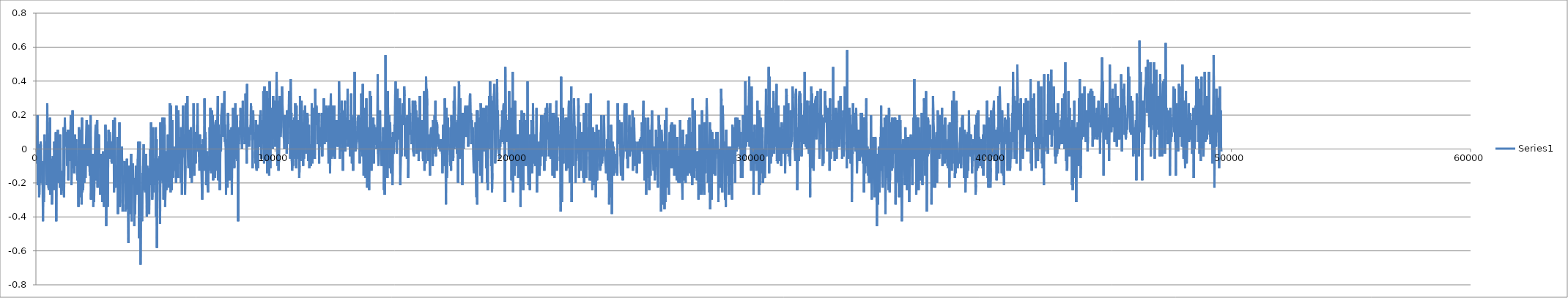
| Category | Series 0 |
|---|---|
| 3.4161954 | -0.043 |
| 18.8090758 | -0.085 |
| 35.1190087 | 0.057 |
| 51.4309406 | 0.085 |
| 67.7428724 | 0.199 |
| 84.056805 | -0.213 |
| 100.3647372 | 0.028 |
| 116.6826694 | 0 |
| 132.9906016 | -0.284 |
| 149.294533 | -0.255 |
| 165.6114663 | -0.17 |
| 181.9213986 | -0.199 |
| 198.23433 | 0.043 |
| 214.5512621 | 0.014 |
| 230.8641946 | -0.128 |
| 247.1801267 | -0.085 |
| 263.4940593 | -0.085 |
| 279.8109925 | -0.213 |
| 296.1239239 | -0.426 |
| 312.4368564 | -0.071 |
| 328.7477871 | -0.312 |
| 345.0657193 | -0.213 |
| 361.3796508 | 0.085 |
| 377.6905815 | -0.085 |
| 394.0005127 | 0.043 |
| 410.3154453 | 0.043 |
| 426.6213779 | -0.028 |
| 442.9363105 | -0.142 |
| 459.2472423 | -0.213 |
| 475.5641739 | 0.27 |
| 491.8741068 | -0.128 |
| 508.1930402 | -0.014 |
| 524.5009718 | -0.227 |
| 540.8219042 | -0.241 |
| 557.132836 | 0.085 |
| 573.4477675 | 0.057 |
| 589.7636996 | 0.185 |
| 606.0816324 | -0.27 |
| 622.4275657 | -0.114 |
| 638.7504976 | -0.057 |
| 655.0704294 | -0.128 |
| 671.3803611 | -0.326 |
| 687.699294 | -0.255 |
| 704.0102247 | -0.043 |
| 720.3291581 | -0.057 |
| 736.6890927 | -0.17 |
| 752.9970243 | -0.241 |
| 769.3179578 | 0.043 |
| 785.6338894 | -0.071 |
| 801.9618233 | -0.028 |
| 818.2787566 | -0.142 |
| 834.5986894 | 0.099 |
| 850.9136215 | -0.426 |
| 867.2485541 | -0.057 |
| 883.5714872 | -0.185 |
| 899.8944202 | -0.156 |
| 916.2403546 | 0.114 |
| 932.5612859 | -0.17 |
| 948.8822172 | -0.199 |
| 965.1951496 | -0.071 |
| 981.5370816 | -0.057 |
| 997.8830154 | -0.227 |
| 1014.2169491 | 0.085 |
| 1030.5278809 | -0.099 |
| 1046.8488138 | -0.213 |
| 1063.1707463 | -0.27 |
| 1079.4866773 | -0.27 |
| 1095.8236117 | -0.213 |
| 1112.1365436 | -0.142 |
| 1128.4564765 | -0.128 |
| 1144.7684084 | -0.241 |
| 1161.084341 | 0.128 |
| 1177.4032739 | -0.284 |
| 1193.7322078 | 0 |
| 1210.0381405 | 0.185 |
| 1226.3630742 | 0.028 |
| 1242.6930077 | 0.014 |
| 1259.0169408 | 0.014 |
| 1275.3368726 | 0.099 |
| 1291.6528058 | 0.028 |
| 1308.0137404 | -0.099 |
| 1324.3206732 | -0.014 |
| 1340.6366053 | 0.114 |
| 1356.9555386 | -0.185 |
| 1373.2604701 | 0.114 |
| 1389.5924037 | 0.057 |
| 1405.9113371 | 0.057 |
| 1422.2312683 | 0.014 |
| 1438.5712018 | -0.071 |
| 1454.8981345 | 0.199 |
| 1471.2190658 | 0 |
| 1487.5369991 | -0.213 |
| 1503.8559303 | -0.043 |
| 1520.1828619 | -0.085 |
| 1536.490793 | 0.227 |
| 1552.8187246 | -0.099 |
| 1569.1446579 | -0.114 |
| 1585.4635896 | -0.043 |
| 1601.7815224 | -0.142 |
| 1618.096455 | 0 |
| 1634.4373896 | 0.085 |
| 1650.756323 | -0.085 |
| 1667.0692538 | -0.071 |
| 1683.3941864 | 0.057 |
| 1699.7141188 | -0.099 |
| 1716.0360512 | -0.071 |
| 1732.3529839 | -0.185 |
| 1748.6799172 | -0.099 |
| 1764.9818485 | -0.071 |
| 1781.2997802 | -0.341 |
| 1797.609713 | 0.128 |
| 1813.9196448 | 0.028 |
| 1830.2515784 | -0.284 |
| 1846.5755104 | -0.028 |
| 1862.9134437 | -0.128 |
| 1879.2323766 | 0.114 |
| 1895.5493087 | -0.142 |
| 1911.8792422 | -0.326 |
| 1928.2571778 | 0.185 |
| 1944.5881114 | -0.255 |
| 1960.9090438 | -0.028 |
| 1977.2239769 | -0.241 |
| 1993.5379089 | 0.028 |
| 2009.8608414 | -0.142 |
| 2026.1697731 | -0.199 |
| 2042.5087071 | 0.028 |
| 2058.8456398 | -0.028 |
| 2075.1635726 | -0.17 |
| 2091.4925066 | 0 |
| 2107.8634418 | 0.114 |
| 2124.188375 | 0.17 |
| 2140.5143054 | -0.085 |
| 2156.8322376 | -0.099 |
| 2173.1811722 | 0.142 |
| 2189.5251064 | 0.099 |
| 2205.8550388 | -0.057 |
| 2222.2039733 | -0.014 |
| 2238.5269053 | -0.099 |
| 2254.8428385 | -0.156 |
| 2271.1697724 | -0.128 |
| 2287.4937049 | 0.199 |
| 2303.836638 | -0.298 |
| 2320.1565692 | -0.199 |
| 2336.482503 | -0.156 |
| 2352.8044349 | -0.099 |
| 2369.1173668 | -0.028 |
| 2385.4553013 | -0.17 |
| 2401.7912351 | -0.341 |
| 2418.1241676 | -0.17 |
| 2434.4401008 | -0.312 |
| 2450.7530333 | -0.099 |
| 2467.0659664 | -0.043 |
| 2483.4389029 | 0.099 |
| 2499.7668345 | 0.142 |
| 2516.1037678 | -0.185 |
| 2532.4146991 | 0.099 |
| 2548.7336319 | 0.156 |
| 2565.081567 | 0.17 |
| 2581.4124999 | -0.227 |
| 2597.728432 | 0.085 |
| 2614.0523657 | -0.085 |
| 2630.3922981 | 0.085 |
| 2646.7162312 | -0.014 |
| 2663.0501643 | -0.114 |
| 2679.4200989 | -0.028 |
| 2695.7400318 | -0.27 |
| 2712.0859668 | -0.028 |
| 2728.4679021 | -0.213 |
| 2744.7978344 | -0.199 |
| 2761.1167667 | -0.043 |
| 2777.4296992 | -0.312 |
| 2793.7416305 | -0.156 |
| 2810.071564 | -0.014 |
| 2826.3814963 | -0.085 |
| 2842.7474324 | -0.341 |
| 2859.0573641 | -0.142 |
| 2875.3632962 | -0.043 |
| 2891.6772282 | -0.27 |
| 2907.9931597 | 0.142 |
| 2924.3090924 | 0.057 |
| 2940.6290253 | -0.454 |
| 2956.9639579 | 0.043 |
| 2973.2828902 | -0.085 |
| 2989.6208241 | -0.17 |
| 3005.9327554 | -0.341 |
| 3022.2576892 | -0.057 |
| 3038.577622 | 0.114 |
| 3054.9195556 | -0.057 |
| 3071.2464884 | 0.014 |
| 3087.6044223 | 0.099 |
| 3103.9353564 | 0.028 |
| 3120.2532897 | -0.057 |
| 3136.580223 | -0.028 |
| 3152.8991542 | 0.028 |
| 3169.2300882 | -0.085 |
| 3185.5600206 | 0.043 |
| 3201.8769528 | -0.071 |
| 3218.2018848 | -0.014 |
| 3234.5228183 | 0.17 |
| 3250.828751 | 0.142 |
| 3267.1486838 | -0.255 |
| 3283.4706163 | -0.057 |
| 3299.7985502 | 0.185 |
| 3316.1064824 | -0.227 |
| 3332.4154141 | -0.099 |
| 3348.7333469 | -0.128 |
| 3365.074281 | -0.099 |
| 3381.4002142 | -0.156 |
| 3397.6961452 | -0.17 |
| 3414.0000766 | 0.071 |
| 3430.3130091 | -0.383 |
| 3446.6329419 | -0.043 |
| 3462.9648761 | -0.043 |
| 3479.2738083 | -0.156 |
| 3495.5777403 | 0.156 |
| 3511.893673 | -0.341 |
| 3528.2386056 | -0.298 |
| 3544.5575385 | -0.085 |
| 3560.8724677 | 0 |
| 3577.1884004 | -0.099 |
| 3593.4993311 | 0.014 |
| 3609.8082633 | -0.099 |
| 3626.1191963 | -0.369 |
| 3642.4291286 | -0.199 |
| 3658.7500598 | -0.156 |
| 3675.0669926 | -0.17 |
| 3691.3779249 | -0.199 |
| 3707.6888579 | -0.071 |
| 3724.0077896 | -0.114 |
| 3740.3307215 | -0.369 |
| 3756.6396543 | -0.298 |
| 3772.9465865 | -0.355 |
| 3789.2565188 | -0.27 |
| 3805.5794524 | -0.057 |
| 3821.8953851 | -0.341 |
| 3838.2113172 | -0.341 |
| 3854.5312501 | -0.255 |
| 3870.8401823 | -0.554 |
| 3887.191117 | -0.099 |
| 3903.5170497 | -0.114 |
| 3919.8459831 | -0.383 |
| 3936.165916 | -0.156 |
| 3952.4738482 | -0.298 |
| 3968.8197831 | -0.085 |
| 3985.1427167 | -0.028 |
| 4001.4616501 | -0.426 |
| 4017.8115853 | -0.156 |
| 4034.1435194 | -0.156 |
| 4050.4624528 | -0.085 |
| 4066.8073871 | -0.185 |
| 4083.1213197 | -0.17 |
| 4099.4942545 | -0.213 |
| 4115.8001866 | -0.454 |
| 4132.1141191 | -0.312 |
| 4148.4350526 | -0.383 |
| 4164.7499852 | -0.185 |
| 4181.0779191 | -0.099 |
| 4197.3908494 | -0.255 |
| 4213.6967809 | -0.142 |
| 4230.0087139 | -0.227 |
| 4246.3356472 | -0.27 |
| 4262.6705809 | -0.057 |
| 4278.995513 | 0.043 |
| 4295.3024435 | -0.028 |
| 4311.6213757 | -0.525 |
| 4327.9333082 | -0.298 |
| 4344.2622416 | 0.043 |
| 4360.5961747 | -0.369 |
| 4376.9091072 | -0.681 |
| 4393.2090373 | -0.355 |
| 4409.5139698 | -0.397 |
| 4425.8359023 | -0.397 |
| 4442.1588348 | -0.426 |
| 4458.4687665 | -0.142 |
| 4474.7746986 | -0.185 |
| 4491.1066322 | -0.057 |
| 4507.442566 | 0.028 |
| 4523.7664975 | -0.241 |
| 4540.0904306 | -0.199 |
| 4556.3953632 | -0.213 |
| 4572.7212958 | -0.255 |
| 4589.0302287 | -0.099 |
| 4605.3431611 | -0.028 |
| 4621.6610945 | -0.255 |
| 4637.9900279 | -0.397 |
| 4654.3009586 | -0.099 |
| 4670.6148911 | -0.27 |
| 4686.9358241 | -0.185 |
| 4703.2687571 | -0.114 |
| 4719.5836903 | -0.227 |
| 4735.9286235 | -0.383 |
| 4752.261556 | -0.156 |
| 4768.5814895 | -0.213 |
| 4784.9104229 | 0 |
| 4801.2343566 | -0.099 |
| 4817.5462895 | 0.156 |
| 4833.8842223 | 0.014 |
| 4850.2111556 | -0.142 |
| 4866.5490896 | -0.298 |
| 4882.9170257 | -0.185 |
| 4899.2519595 | 0.128 |
| 4915.5668915 | -0.255 |
| 4931.8778245 | -0.057 |
| 4948.1817559 | -0.213 |
| 4964.5126894 | -0.213 |
| 4980.8576243 | -0.142 |
| 4997.1785578 | -0.114 |
| 5013.4964906 | 0.128 |
| 5029.8274224 | -0.397 |
| 5046.1553546 | 0.057 |
| 5062.4662876 | -0.582 |
| 5078.7952193 | -0.142 |
| 5095.1131515 | -0.114 |
| 5111.4230838 | -0.128 |
| 5127.7370164 | -0.057 |
| 5144.0609495 | -0.085 |
| 5160.3858827 | -0.185 |
| 5176.7258173 | -0.043 |
| 5193.0377491 | -0.44 |
| 5209.3576815 | 0.156 |
| 5225.6736136 | -0.142 |
| 5241.9845454 | -0.043 |
| 5258.2974773 | -0.185 |
| 5274.6034077 | -0.185 |
| 5290.9203399 | 0.185 |
| 5307.2422729 | -0.199 |
| 5323.6152071 | 0 |
| 5339.9321398 | -0.298 |
| 5356.2380725 | 0.028 |
| 5372.5600049 | 0.185 |
| 5388.8699373 | 0.114 |
| 5405.1818697 | -0.341 |
| 5421.4948016 | -0.199 |
| 5437.8107332 | -0.028 |
| 5454.1176659 | -0.241 |
| 5470.4445992 | -0.014 |
| 5486.7655315 | -0.199 |
| 5503.1034655 | -0.099 |
| 5519.4724012 | 0.085 |
| 5535.8083344 | -0.142 |
| 5552.1262666 | -0.227 |
| 5568.4461984 | 0.043 |
| 5584.7771319 | -0.199 |
| 5601.0970648 | 0.27 |
| 5617.4159965 | 0 |
| 5633.7619309 | -0.255 |
| 5650.078863 | 0.255 |
| 5666.4027962 | 0.028 |
| 5682.746731 | -0.241 |
| 5699.0726637 | 0.17 |
| 5715.3835955 | -0.014 |
| 5731.7055268 | -0.17 |
| 5748.0204594 | -0.142 |
| 5764.3303917 | -0.099 |
| 5780.6543248 | -0.128 |
| 5796.9832582 | 0.014 |
| 5813.291191 | -0.014 |
| 5829.6111244 | -0.085 |
| 5845.932058 | -0.099 |
| 5862.2359894 | -0.199 |
| 5878.5469217 | 0.255 |
| 5894.8618538 | -0.043 |
| 5911.1667853 | 0 |
| 5927.4867181 | -0.014 |
| 5943.8216525 | -0.17 |
| 5960.1435855 | 0.227 |
| 5976.4535172 | 0 |
| 5992.7684498 | -0.085 |
| 6009.0773826 | 0.071 |
| 6025.3933153 | 0.071 |
| 6041.7062483 | -0.085 |
| 6058.0561824 | -0.199 |
| 6074.391115 | 0.128 |
| 6090.7300484 | -0.085 |
| 6107.03698 | -0.27 |
| 6123.3579124 | 0.043 |
| 6139.7018461 | 0.114 |
| 6156.0117773 | 0.255 |
| 6172.3197101 | 0.028 |
| 6188.629643 | 0.085 |
| 6204.9435761 | -0.043 |
| 6221.254509 | -0.057 |
| 6237.5714423 | -0.27 |
| 6253.889375 | -0.099 |
| 6270.2023075 | 0.27 |
| 6286.5632428 | 0.028 |
| 6302.8681748 | 0 |
| 6319.1841074 | 0.014 |
| 6335.4900395 | 0.312 |
| 6351.812972 | -0.014 |
| 6368.1299053 | -0.099 |
| 6384.446838 | -0.114 |
| 6400.7747708 | 0.014 |
| 6417.0937037 | 0.114 |
| 6433.4026359 | -0.014 |
| 6449.7365696 | -0.114 |
| 6466.0625028 | -0.17 |
| 6482.3834352 | 0.128 |
| 6498.6953671 | 0.028 |
| 6515.0103003 | -0.199 |
| 6531.3212326 | -0.128 |
| 6547.6461664 | -0.128 |
| 6563.9851003 | -0.085 |
| 6580.3040332 | -0.114 |
| 6596.6129632 | 0.27 |
| 6612.9118938 | -0.128 |
| 6629.2248257 | -0.156 |
| 6645.5227573 | 0.057 |
| 6661.8686917 | 0.099 |
| 6678.1816231 | -0.085 |
| 6694.4895547 | 0.099 |
| 6710.8094876 | 0.043 |
| 6727.1124184 | 0.028 |
| 6743.4363515 | 0.142 |
| 6759.7772851 | 0.27 |
| 6776.0822171 | -0.014 |
| 6792.3951501 | 0.014 |
| 6808.7150825 | 0 |
| 6825.0340159 | -0.057 |
| 6841.3459477 | -0.128 |
| 6857.6608803 | 0.085 |
| 6873.9928139 | -0.085 |
| 6890.3117462 | -0.043 |
| 6906.6246787 | 0.028 |
| 6922.9316114 | -0.128 |
| 6939.2485435 | -0.227 |
| 6955.5844751 | -0.298 |
| 6971.8894066 | -0.17 |
| 6988.2023396 | 0.057 |
| 7004.532272 | -0.071 |
| 7020.8552056 | -0.014 |
| 7037.1781386 | -0.128 |
| 7053.5190716 | 0.298 |
| 7069.8260043 | 0.028 |
| 7086.1649377 | 0.099 |
| 7102.4898704 | 0.057 |
| 7118.812804 | -0.213 |
| 7135.1467377 | -0.071 |
| 7151.4606697 | -0.128 |
| 7167.7866034 | -0.014 |
| 7184.1025367 | -0.227 |
| 7200.4204694 | -0.255 |
| 7216.7334019 | -0.043 |
| 7233.0603347 | -0.128 |
| 7249.3742666 | -0.085 |
| 7265.7011999 | 0.128 |
| 7282.0291333 | -0.028 |
| 7298.3480656 | 0.241 |
| 7314.659998 | 0.043 |
| 7331.0059312 | -0.142 |
| 7347.3358647 | 0.099 |
| 7363.6497978 | 0.227 |
| 7379.9647304 | -0.057 |
| 7396.2856622 | 0.199 |
| 7412.5955934 | -0.185 |
| 7428.9425279 | 0.142 |
| 7445.2614607 | 0.128 |
| 7461.5683912 | -0.057 |
| 7477.8753233 | -0.142 |
| 7494.1862551 | -0.17 |
| 7510.4911861 | 0.156 |
| 7526.8001183 | 0.17 |
| 7543.1290523 | 0.156 |
| 7559.4439838 | -0.128 |
| 7575.797918 | 0.099 |
| 7592.128851 | 0.099 |
| 7608.4447842 | 0.312 |
| 7624.7697168 | -0.185 |
| 7641.0836494 | 0.142 |
| 7657.3895815 | -0.028 |
| 7673.720515 | 0.014 |
| 7690.035447 | -0.241 |
| 7706.3513797 | -0.085 |
| 7722.6623121 | 0.085 |
| 7739.0132473 | -0.014 |
| 7755.3311801 | 0.199 |
| 7771.6501129 | 0.199 |
| 7787.9590446 | 0.27 |
| 7804.2779769 | 0.241 |
| 7820.5869097 | 0.128 |
| 7836.9518446 | 0.071 |
| 7853.2637776 | 0.213 |
| 7869.5727098 | 0.185 |
| 7885.9186437 | 0.341 |
| 7902.2265753 | 0.043 |
| 7918.551509 | 0.142 |
| 7934.8644415 | 0.014 |
| 7951.2063746 | -0.27 |
| 7967.5203071 | -0.057 |
| 7983.9042442 | 0.057 |
| 8000.2061749 | -0.142 |
| 8016.5621093 | -0.227 |
| 8032.8770414 | 0.213 |
| 8049.1859742 | 0.142 |
| 8065.4979072 | -0.185 |
| 8081.8278401 | 0 |
| 8098.1327716 | 0.114 |
| 8114.4417038 | 0.099 |
| 8130.7936369 | 0.057 |
| 8147.1175689 | -0.185 |
| 8163.4205002 | -0.156 |
| 8179.7474324 | 0.128 |
| 8196.0833668 | -0.27 |
| 8212.4023002 | 0.128 |
| 8228.7062321 | -0.085 |
| 8245.034166 | 0.241 |
| 8261.3690998 | 0.128 |
| 8277.7020334 | 0.014 |
| 8294.0219657 | -0.114 |
| 8310.349898 | -0.099 |
| 8326.6878325 | 0.128 |
| 8343.0027651 | 0.27 |
| 8359.3106978 | -0.028 |
| 8375.6276305 | -0.057 |
| 8391.9605642 | 0.199 |
| 8408.2754968 | 0.156 |
| 8424.593429 | -0.071 |
| 8440.9163626 | 0.071 |
| 8457.2322953 | -0.426 |
| 8473.5652289 | 0.043 |
| 8489.8751612 | 0.028 |
| 8506.2020951 | 0.128 |
| 8522.5330291 | 0.085 |
| 8538.8479617 | 0.114 |
| 8555.1728949 | 0.241 |
| 8571.4998276 | 0.185 |
| 8587.8037596 | 0.114 |
| 8604.1206923 | 0.028 |
| 8620.4586263 | 0 |
| 8636.7705587 | 0.128 |
| 8653.089491 | 0.284 |
| 8669.4054236 | 0.071 |
| 8685.736356 | 0.114 |
| 8702.0382884 | 0.085 |
| 8718.3462206 | 0.114 |
| 8734.6601532 | 0.028 |
| 8750.9850864 | 0.128 |
| 8767.2910184 | 0.326 |
| 8783.6169506 | 0.057 |
| 8799.9398825 | 0.085 |
| 8816.2558152 | -0.085 |
| 8832.5687477 | 0.383 |
| 8848.8816796 | 0.014 |
| 8865.2156133 | 0.085 |
| 8881.5295464 | 0.128 |
| 8897.8564791 | 0.114 |
| 8914.1724123 | 0.057 |
| 8930.4843448 | 0.014 |
| 8946.8082773 | 0.114 |
| 8963.1292103 | 0.085 |
| 8979.4561413 | 0.142 |
| 8995.7740747 | 0.27 |
| 9012.1050082 | 0.142 |
| 9028.4249399 | 0.142 |
| 9044.7448728 | 0.185 |
| 9061.0658047 | -0.114 |
| 9070.732782 | -0.014 |
| 9087.0237137 | 0.227 |
| 9103.3386463 | 0.099 |
| 9119.6505793 | 0.057 |
| 9136.0065126 | 0.099 |
| 9152.335446 | 0.085 |
| 9168.6373784 | 0.043 |
| 9184.9383102 | -0.085 |
| 9201.2752435 | 0.17 |
| 9217.6201779 | -0.114 |
| 9233.9441115 | -0.128 |
| 9250.2540438 | 0.014 |
| 9266.5729772 | 0.142 |
| 9282.8899094 | -0.114 |
| 9299.2078427 | 0 |
| 9315.5237754 | 0.057 |
| 9331.8407081 | 0.114 |
| 9348.1476402 | 0.014 |
| 9364.472574 | 0.199 |
| 9380.7925069 | 0.014 |
| 9397.1114386 | 0.227 |
| 9413.4363712 | 0.085 |
| 9429.7713055 | -0.057 |
| 9446.0892377 | 0.17 |
| 9462.4191712 | 0.043 |
| 9478.7331037 | 0.028 |
| 9495.0610371 | 0.043 |
| 9511.3819706 | 0.341 |
| 9527.695902 | 0 |
| 9544.0128342 | -0.085 |
| 9560.338768 | 0.369 |
| 9576.6467002 | 0.028 |
| 9592.9636318 | 0.028 |
| 9609.296566 | 0.156 |
| 9625.6285001 | 0.199 |
| 9641.9434332 | -0.071 |
| 9658.2423633 | 0.341 |
| 9674.5622967 | -0.142 |
| 9690.8952309 | 0.028 |
| 9707.2161644 | 0.114 |
| 9723.5360956 | 0.298 |
| 9739.8490281 | 0.255 |
| 9756.16196 | -0.156 |
| 9772.4898939 | 0.397 |
| 9788.8088257 | 0.355 |
| 9805.1417587 | -0.114 |
| 9821.4846929 | 0.241 |
| 9837.8456271 | 0.227 |
| 9854.1495579 | 0.227 |
| 9870.4664901 | 0.099 |
| 9886.7874219 | 0.057 |
| 9903.1133557 | 0 |
| 9919.4272888 | 0.312 |
| 9935.7382217 | 0.227 |
| 9952.0621537 | 0.199 |
| 9968.3970869 | 0.057 |
| 9984.746022 | 0.284 |
| 10001.0609546 | 0.014 |
| 10017.3778868 | 0.085 |
| 10033.7098198 | 0.114 |
| 10050.0297527 | 0.099 |
| 10066.3556859 | 0.454 |
| 10082.6666189 | 0.213 |
| 10098.9705497 | -0.099 |
| 10115.2864818 | 0.185 |
| 10131.593414 | 0.284 |
| 10147.9053458 | -0.128 |
| 10164.24728 | -0.071 |
| 10180.5792136 | 0.028 |
| 10196.9131472 | 0.312 |
| 10213.2330807 | 0.227 |
| 10229.5490133 | 0.071 |
| 10245.8719464 | 0.071 |
| 10262.1858784 | 0.142 |
| 10278.4958102 | 0.227 |
| 10294.8067409 | 0.369 |
| 10311.121674 | 0.27 |
| 10327.4536081 | 0.213 |
| 10343.7745411 | 0.17 |
| 10360.0924744 | 0.071 |
| 10376.4084076 | 0.057 |
| 10392.7243397 | 0 |
| 10409.0382729 | 0.199 |
| 10425.3512059 | 0.043 |
| 10441.7091404 | 0.085 |
| 10458.0420718 | 0.114 |
| 10474.3480044 | 0.085 |
| 10490.6609364 | -0.028 |
| 10506.9768696 | 0.227 |
| 10523.2938012 | 0.028 |
| 10539.6087332 | 0.099 |
| 10555.9296667 | 0.17 |
| 10572.2686013 | 0.128 |
| 10588.5925344 | 0.341 |
| 10604.9014661 | 0.255 |
| 10621.2193994 | 0.199 |
| 10637.525331 | -0.057 |
| 10653.8392624 | 0.412 |
| 10670.1581958 | 0.17 |
| 10686.4771286 | 0.213 |
| 10702.824063 | -0.071 |
| 10719.1389962 | -0.128 |
| 10735.4829305 | -0.028 |
| 10751.8078642 | -0.099 |
| 10768.1117945 | 0.17 |
| 10784.4207262 | 0.099 |
| 10800.7356588 | 0.185 |
| 10817.0635922 | 0 |
| 10833.3935256 | -0.057 |
| 10849.7204589 | 0.27 |
| 10866.0633925 | 0.057 |
| 10882.3813253 | -0.114 |
| 10898.7152585 | 0.255 |
| 10915.0261903 | -0.057 |
| 10931.3641242 | -0.057 |
| 10947.6800563 | 0.085 |
| 10963.9919887 | 0.17 |
| 10980.3129217 | -0.014 |
| 10996.6118539 | 0.071 |
| 11012.9317874 | -0.17 |
| 11029.2607191 | -0.099 |
| 11045.5786507 | 0.312 |
| 11061.9095843 | -0.071 |
| 11078.2605178 | 0 |
| 11094.5824508 | 0.014 |
| 11110.9313859 | 0.284 |
| 11127.2223172 | 0.142 |
| 11143.5452491 | 0.028 |
| 11159.8621824 | 0.142 |
| 11176.1791156 | -0.099 |
| 11192.507049 | 0.156 |
| 11208.8259807 | -0.057 |
| 11225.1809162 | 0.227 |
| 11241.4918469 | 0.085 |
| 11257.8257811 | 0.255 |
| 11274.1447139 | 0.156 |
| 11290.4646468 | 0.014 |
| 11306.7905801 | -0.028 |
| 11323.1275145 | 0.114 |
| 11339.4594486 | 0.199 |
| 11355.7783809 | 0.213 |
| 11372.0993127 | 0.156 |
| 11388.4142448 | -0.071 |
| 11404.7281779 | 0 |
| 11421.0761118 | 0.142 |
| 11437.3940446 | -0.114 |
| 11453.7189783 | 0.028 |
| 11470.034911 | -0.043 |
| 11486.357844 | 0.014 |
| 11502.6697759 | -0.099 |
| 11518.9847074 | 0.014 |
| 11535.3236419 | 0.27 |
| 11551.6605763 | 0.185 |
| 11567.9785091 | -0.085 |
| 11584.2944412 | 0.043 |
| 11600.6093733 | 0.142 |
| 11616.9413068 | 0.241 |
| 11633.2592402 | -0.057 |
| 11649.5661717 | -0.028 |
| 11665.8981048 | -0.057 |
| 11682.2180382 | 0.355 |
| 11698.5499707 | 0.213 |
| 11714.8799047 | 0.142 |
| 11731.2108371 | 0.255 |
| 11747.5197694 | 0.17 |
| 11763.8307017 | 0.156 |
| 11780.169634 | 0.028 |
| 11796.4965673 | 0.17 |
| 11812.8465025 | 0.142 |
| 11829.1704362 | 0.213 |
| 11845.4743687 | -0.085 |
| 11861.7973023 | 0.114 |
| 11878.1152351 | 0.128 |
| 11894.4491693 | 0.014 |
| 11910.7671021 | 0.057 |
| 11927.1130348 | 0.085 |
| 11943.4179674 | 0.071 |
| 11959.7398998 | 0.213 |
| 11976.0488327 | -0.043 |
| 11992.3617651 | 0.099 |
| 12008.6966978 | 0.199 |
| 12025.0406315 | 0.028 |
| 12041.3505644 | 0.298 |
| 12057.6644969 | 0.043 |
| 12073.9924291 | 0.028 |
| 12090.312362 | 0.227 |
| 12106.6222938 | 0.085 |
| 12122.9692271 | 0.057 |
| 12139.2921602 | 0.043 |
| 12155.6020919 | 0.255 |
| 12171.9130237 | 0.199 |
| 12188.2279563 | 0.241 |
| 12204.5418889 | 0.185 |
| 12220.8518218 | 0.043 |
| 12237.1667538 | -0.085 |
| 12253.4986879 | -0.057 |
| 12269.8206209 | 0.255 |
| 12286.1445541 | 0.071 |
| 12302.4674871 | -0.142 |
| 12318.7784195 | 0.241 |
| 12335.1053533 | 0.326 |
| 12351.4312871 | 0.028 |
| 12367.733219 | -0.057 |
| 12384.0561515 | 0.227 |
| 12400.3660832 | 0.255 |
| 12416.6980163 | 0.255 |
| 12433.0049473 | -0.043 |
| 12449.3218806 | 0.071 |
| 12465.6318134 | 0.099 |
| 12481.9447454 | 0.255 |
| 12498.2796786 | -0.057 |
| 12514.5896098 | 0.028 |
| 12530.9025411 | 0.071 |
| 12547.231474 | 0.142 |
| 12563.5694079 | 0.17 |
| 12579.8773401 | 0.17 |
| 12596.1962718 | 0.014 |
| 12612.5012033 | 0.17 |
| 12628.8571382 | 0.043 |
| 12645.2320737 | 0.014 |
| 12661.5420049 | 0.156 |
| 12677.8609372 | 0.397 |
| 12694.171869 | 0.227 |
| 12710.4918002 | -0.057 |
| 12726.8137315 | 0.17 |
| 12743.1726667 | 0.213 |
| 12759.4855992 | 0.114 |
| 12775.8065327 | 0.028 |
| 12792.119464 | 0.284 |
| 12808.4353961 | -0.014 |
| 12824.7673303 | 0.028 |
| 12841.0772631 | -0.128 |
| 12857.3901945 | 0.156 |
| 12873.7011263 | 0.156 |
| 12890.0270601 | 0.227 |
| 12906.3479925 | 0.17 |
| 12922.7049281 | 0.284 |
| 12939.070863 | -0.014 |
| 12955.3957962 | 0.185 |
| 12971.7487304 | 0.085 |
| 12988.0646631 | 0.071 |
| 13004.3805952 | 0.128 |
| 13020.6935277 | 0.057 |
| 13037.0104598 | 0.355 |
| 13053.3573937 | 0.014 |
| 13069.6693256 | 0.085 |
| 13085.9802585 | 0.128 |
| 13102.2941911 | 0.17 |
| 13118.6361252 | 0.128 |
| 13134.9570587 | -0.043 |
| 13151.2719913 | 0.114 |
| 13167.5929237 | -0.028 |
| 13183.9208565 | 0.326 |
| 13200.2977932 | 0.057 |
| 13216.6097262 | -0.085 |
| 13232.9266583 | 0.128 |
| 13249.2495908 | 0.185 |
| 13265.5655235 | -0.128 |
| 13281.8854564 | 0.057 |
| 13298.2313913 | 0.199 |
| 13314.5463239 | 0.071 |
| 13330.8752573 | 0.454 |
| 13347.18219 | 0.043 |
| 13363.5141242 | -0.014 |
| 13379.8450577 | 0.043 |
| 13396.1799903 | 0 |
| 13412.4949235 | 0.071 |
| 13428.8018562 | 0.057 |
| 13445.1197895 | 0.057 |
| 13461.4457216 | 0.185 |
| 13477.8226583 | 0.185 |
| 13494.1545925 | 0.199 |
| 13510.4615241 | 0.043 |
| 13526.7814553 | 0.028 |
| 13543.0973863 | -0.085 |
| 13559.4113188 | 0.142 |
| 13575.7412517 | 0.185 |
| 13592.0731847 | -0.014 |
| 13608.3891174 | 0.326 |
| 13624.7080508 | 0.284 |
| 13641.0139834 | 0.028 |
| 13657.3319151 | -0.043 |
| 13673.6528475 | 0.383 |
| 13689.96678 | -0.028 |
| 13706.2827116 | -0.156 |
| 13722.601645 | 0.043 |
| 13738.9305778 | 0.085 |
| 13755.2465099 | 0.241 |
| 13771.5544421 | 0.014 |
| 13787.8873746 | -0.17 |
| 13804.1933073 | 0.185 |
| 13820.5042402 | 0.298 |
| 13836.831174 | 0.156 |
| 13853.1561078 | -0.227 |
| 13869.4680408 | 0.099 |
| 13885.8129745 | 0.128 |
| 13902.135907 | -0.17 |
| 13918.4538404 | -0.085 |
| 13934.7897747 | -0.241 |
| 13951.0947062 | -0.014 |
| 13967.4186388 | 0.341 |
| 13983.736571 | -0.043 |
| 14000.0495018 | 0.128 |
| 14016.3654339 | 0.312 |
| 14032.6783658 | -0.128 |
| 14048.9902982 | 0.085 |
| 14065.3372316 | 0.142 |
| 14081.658164 | 0.014 |
| 14097.9760967 | 0.014 |
| 14114.3010299 | 0.185 |
| 14130.613963 | -0.085 |
| 14146.9318963 | 0.142 |
| 14163.274831 | 0.099 |
| 14179.580762 | 0.057 |
| 14195.9046946 | 0.128 |
| 14212.2196261 | 0.099 |
| 14228.5315574 | 0.057 |
| 14244.8474906 | 0 |
| 14261.1574235 | 0.014 |
| 14277.4723561 | 0.142 |
| 14293.8052897 | 0.44 |
| 14310.1202218 | -0.028 |
| 14326.449154 | -0.099 |
| 14342.7570868 | 0.128 |
| 14359.0700198 | 0.043 |
| 14375.3829529 | 0.099 |
| 14391.6988861 | 0.227 |
| 14408.0148188 | 0.014 |
| 14424.3577535 | -0.014 |
| 14440.6696865 | -0.085 |
| 14456.9876176 | -0.099 |
| 14473.3105507 | -0.071 |
| 14489.6284829 | 0.043 |
| 14505.944415 | -0.099 |
| 14522.2793476 | 0.128 |
| 14538.6152814 | 0.099 |
| 14554.9292134 | -0.241 |
| 14571.252147 | 0.085 |
| 14587.5710804 | -0.27 |
| 14603.886013 | 0.028 |
| 14620.2029446 | 0.554 |
| 14636.5188773 | 0.099 |
| 14652.8368095 | 0.099 |
| 14669.1507421 | 0.085 |
| 14685.4636751 | 0.099 |
| 14701.7776076 | -0.17 |
| 14718.0995407 | 0.341 |
| 14734.4094719 | 0.128 |
| 14750.7254045 | -0.014 |
| 14767.0493382 | 0.114 |
| 14783.3972727 | 0.199 |
| 14799.7222059 | -0.114 |
| 14816.057139 | 0.156 |
| 14832.378072 | -0.043 |
| 14848.7010056 | -0.142 |
| 14865.0179389 | 0.071 |
| 14881.3358717 | 0.043 |
| 14897.6698053 | -0.114 |
| 14913.9967392 | -0.213 |
| 14930.3146725 | 0.099 |
| 14946.6466067 | 0.057 |
| 14962.9645394 | -0.028 |
| 14979.2774719 | -0.014 |
| 14995.5964053 | 0.142 |
| 15011.9123385 | 0.043 |
| 15028.2302707 | 0.326 |
| 15044.5502031 | 0.397 |
| 15060.8741362 | 0.241 |
| 15077.1960692 | 0.099 |
| 15093.5130019 | -0.028 |
| 15109.8509358 | 0.128 |
| 15126.1588675 | 0.355 |
| 15142.4948013 | 0.057 |
| 15158.8137347 | 0.114 |
| 15175.1296662 | 0.227 |
| 15191.4465989 | 0.142 |
| 15207.7635311 | 0.213 |
| 15224.0804633 | 0.298 |
| 15240.3903956 | -0.213 |
| 15256.7243298 | -0.043 |
| 15273.034261 | 0.199 |
| 15289.3511926 | -0.043 |
| 15305.6771264 | 0.17 |
| 15321.9970593 | 0.185 |
| 15338.3129925 | 0.255 |
| 15354.6239254 | 0.27 |
| 15370.9408582 | 0.142 |
| 15387.2657913 | 0.156 |
| 15403.5877243 | 0.369 |
| 15419.9256583 | 0.312 |
| 15436.2555923 | -0.043 |
| 15452.5685248 | 0.014 |
| 15468.8814567 | -0.014 |
| 15485.1963899 | 0.114 |
| 15501.5083228 | 0.185 |
| 15517.817254 | -0.057 |
| 15534.1591881 | 0.199 |
| 15550.4761209 | 0.099 |
| 15566.8060549 | -0.17 |
| 15583.1389891 | -0.085 |
| 15599.4449212 | 0.128 |
| 15615.7618544 | 0.298 |
| 15632.0677865 | 0.156 |
| 15648.3787189 | 0.213 |
| 15664.7006519 | 0.085 |
| 15681.042586 | 0.114 |
| 15697.3895205 | 0.099 |
| 15713.721454 | 0.028 |
| 15730.0393868 | 0.085 |
| 15746.3773191 | 0.057 |
| 15762.705253 | 0.284 |
| 15779.0161848 | -0.014 |
| 15795.3611185 | -0.028 |
| 15811.6810514 | -0.043 |
| 15828.012985 | 0.099 |
| 15844.333918 | 0.142 |
| 15860.6558493 | 0.284 |
| 15876.9617808 | 0.241 |
| 15893.279713 | 0.185 |
| 15909.6476476 | 0.227 |
| 15925.9595794 | -0.028 |
| 15942.2905129 | 0.142 |
| 15958.6344466 | 0.071 |
| 15974.9693804 | 0.185 |
| 15991.2723123 | 0.085 |
| 16007.5932436 | -0.071 |
| 16023.9191763 | 0.071 |
| 16040.2421088 | -0.014 |
| 16056.5580409 | 0.312 |
| 16072.8619723 | 0.17 |
| 16089.1799056 | 0.128 |
| 16105.5128387 | 0.156 |
| 16121.8247711 | -0.014 |
| 16138.1417044 | 0.014 |
| 16154.468636 | 0.128 |
| 16170.7905696 | 0.17 |
| 16187.113501 | -0.057 |
| 16203.4404337 | -0.071 |
| 16219.7663669 | 0 |
| 16236.0993011 | 0.341 |
| 16252.4262344 | -0.128 |
| 16268.7441672 | 0.085 |
| 16285.0781003 | 0.071 |
| 16301.4780355 | -0.085 |
| 16317.7949677 | 0.426 |
| 16334.121901 | 0.284 |
| 16350.4328339 | 0.355 |
| 16366.7977694 | 0.255 |
| 16383.1047015 | -0.014 |
| 16399.4216348 | -0.014 |
| 16415.7535684 | -0.071 |
| 16432.068501 | 0.057 |
| 16448.3874344 | 0.085 |
| 16464.6973672 | -0.071 |
| 16481.0413021 | -0.156 |
| 16497.3792365 | 0.071 |
| 16513.684168 | 0.114 |
| 16530.0051015 | 0.128 |
| 16546.3160339 | 0.114 |
| 16562.631966 | 0.014 |
| 16578.9708988 | 0.128 |
| 16595.2838313 | -0.099 |
| 16611.5977639 | 0.17 |
| 16627.9206975 | 0.142 |
| 16644.2366302 | 0.099 |
| 16660.5615633 | -0.028 |
| 16676.8864965 | 0.199 |
| 16693.1994284 | -0.028 |
| 16709.5073612 | 0.284 |
| 16725.8202942 | -0.043 |
| 16742.1502277 | 0.17 |
| 16758.4641591 | 0.014 |
| 16774.7790917 | 0.156 |
| 16791.0930243 | 0.128 |
| 16807.4259579 | 0.028 |
| 16823.7508917 | 0.085 |
| 16840.0678249 | 0.071 |
| 16856.380758 | 0.028 |
| 16872.6986907 | 0 |
| 16889.0366247 | 0.028 |
| 16905.3395566 | 0 |
| 16921.6624896 | -0.014 |
| 16937.9814225 | 0.057 |
| 16954.2893547 | 0.028 |
| 16970.5952868 | 0.057 |
| 16986.9132179 | -0.028 |
| 17003.2251497 | -0.142 |
| 17019.5530831 | 0.043 |
| 17035.8680151 | 0.142 |
| 17052.1889486 | -0.099 |
| 17068.5058797 | 0.028 |
| 17084.8298128 | 0.014 |
| 17101.154746 | 0.298 |
| 17117.4706775 | 0.185 |
| 17133.791611 | 0.185 |
| 17150.1205433 | -0.326 |
| 17166.471478 | 0.241 |
| 17182.794411 | -0.17 |
| 17199.1253445 | -0.128 |
| 17215.4692782 | -0.071 |
| 17231.796211 | 0.185 |
| 17248.1161439 | 0.028 |
| 17264.4440778 | 0.014 |
| 17280.7650107 | 0.014 |
| 17297.0879438 | 0.028 |
| 17313.3958749 | -0.014 |
| 17329.7078073 | -0.099 |
| 17346.0347411 | 0.128 |
| 17362.354674 | -0.128 |
| 17378.6756064 | 0.199 |
| 17394.9955376 | 0.128 |
| 17411.3334716 | 0.128 |
| 17427.6594037 | 0.014 |
| 17443.9823362 | -0.071 |
| 17460.3292712 | -0.043 |
| 17476.6402035 | 0.284 |
| 17492.9691358 | 0 |
| 17509.2900688 | 0.369 |
| 17525.6060009 | 0.227 |
| 17541.911933 | 0.114 |
| 17558.2398646 | 0.014 |
| 17574.5727983 | 0.114 |
| 17590.8957313 | 0.156 |
| 17607.2256642 | -0.028 |
| 17623.5385967 | 0.071 |
| 17639.8565295 | 0.17 |
| 17656.1914621 | -0.199 |
| 17672.5073942 | 0.199 |
| 17688.8363282 | 0.397 |
| 17705.1472606 | 0.369 |
| 17721.4631938 | -0.057 |
| 17737.8041284 | 0.043 |
| 17754.1380621 | 0.298 |
| 17770.4629953 | 0.057 |
| 17786.7849277 | -0.043 |
| 17803.0948589 | -0.028 |
| 17819.4087909 | 0.213 |
| 17835.7337235 | -0.213 |
| 17852.0506563 | 0.057 |
| 17868.3985913 | 0.213 |
| 17884.7535262 | 0 |
| 17901.0764576 | 0.071 |
| 17917.4303924 | 0.156 |
| 17933.7453239 | 0.071 |
| 17950.0462557 | 0.241 |
| 17966.3571864 | 0.255 |
| 17982.6971199 | 0.114 |
| 17999.0220536 | 0.156 |
| 18015.3359867 | 0.085 |
| 18031.6339178 | 0.071 |
| 18047.9458502 | 0.185 |
| 18064.3097862 | 0.255 |
| 18080.6317192 | 0.014 |
| 18096.9416509 | 0.057 |
| 18113.2575836 | 0.142 |
| 18129.5725168 | 0.227 |
| 18145.91745 | 0.312 |
| 18162.2493835 | 0.326 |
| 18178.5913171 | 0.156 |
| 18194.913249 | 0.213 |
| 18211.2231808 | 0.028 |
| 18227.5521142 | 0.17 |
| 18243.8810476 | 0.099 |
| 18260.216982 | 0.071 |
| 18276.5769171 | 0.128 |
| 18292.8848488 | 0.128 |
| 18309.2117821 | -0.128 |
| 18325.5317144 | -0.142 |
| 18341.8546475 | -0.128 |
| 18358.1635797 | -0.014 |
| 18374.4975128 | -0.057 |
| 18390.8104459 | 0.156 |
| 18407.1363797 | -0.199 |
| 18423.473313 | -0.284 |
| 18439.8392491 | 0.227 |
| 18456.1601826 | -0.326 |
| 18472.4811138 | 0.227 |
| 18488.7830463 | -0.071 |
| 18505.0949781 | 0.014 |
| 18521.4119108 | 0.071 |
| 18537.7608448 | 0.028 |
| 18554.0767775 | -0.028 |
| 18570.4117118 | 0.185 |
| 18586.728644 | -0.156 |
| 18603.0435766 | 0.27 |
| 18619.3655096 | 0.227 |
| 18635.668442 | -0.028 |
| 18651.997376 | -0.199 |
| 18668.3333092 | 0.014 |
| 18684.6652434 | 0.142 |
| 18700.9701754 | 0.241 |
| 18717.2841074 | 0.085 |
| 18733.6280422 | -0.014 |
| 18749.9559744 | 0.142 |
| 18766.2649061 | 0.199 |
| 18782.5818394 | 0.241 |
| 18798.9187727 | 0.114 |
| 18815.2367055 | 0.185 |
| 18831.5586374 | -0.114 |
| 18847.8845689 | 0.255 |
| 18864.2055002 | -0.199 |
| 18880.5344325 | 0.142 |
| 18896.8563655 | -0.241 |
| 18913.1782985 | 0.156 |
| 18929.4942312 | 0.114 |
| 18945.8091643 | 0 |
| 18962.1390978 | 0.312 |
| 18978.4690301 | 0.057 |
| 18994.8159646 | 0.397 |
| 19011.1568987 | 0.17 |
| 19027.5158332 | 0.312 |
| 19043.8357667 | -0.099 |
| 19060.1537 | 0.114 |
| 19076.468632 | -0.255 |
| 19092.7945642 | -0.142 |
| 19109.0994956 | 0.284 |
| 19125.4254283 | 0.17 |
| 19141.7303598 | 0.114 |
| 19158.0602927 | 0.326 |
| 19174.3832252 | 0.383 |
| 19190.7171589 | 0.17 |
| 19207.0200914 | -0.085 |
| 19223.3420249 | -0.085 |
| 19239.6529573 | 0.028 |
| 19256.0148931 | 0.199 |
| 19272.3218258 | 0.199 |
| 19288.6407587 | 0.412 |
| 19304.9586914 | 0.114 |
| 19321.2716239 | 0.227 |
| 19337.5905562 | 0 |
| 19353.8994874 | -0.028 |
| 19370.22442 | 0 |
| 19386.5523539 | -0.057 |
| 19402.8672865 | 0.057 |
| 19419.1882194 | 0.014 |
| 19435.510153 | 0.071 |
| 19451.8220849 | 0.114 |
| 19468.1460169 | 0.043 |
| 19484.4769504 | 0.128 |
| 19500.7968833 | 0.227 |
| 19517.1168162 | 0.043 |
| 19533.4377485 | 0.17 |
| 19549.7726828 | 0.255 |
| 19566.0766148 | 0.27 |
| 19582.3995484 | 0.028 |
| 19598.7134793 | 0.142 |
| 19615.0364118 | -0.312 |
| 19631.3393432 | 0.483 |
| 19647.6672765 | 0.213 |
| 19664.0212108 | 0.185 |
| 19680.337144 | 0.142 |
| 19696.6540762 | 0.043 |
| 19712.9590071 | 0.17 |
| 19729.2689394 | 0.071 |
| 19745.5768722 | 0.142 |
| 19761.8968051 | 0.071 |
| 19778.2177386 | -0.043 |
| 19794.5406722 | 0.341 |
| 19810.8966071 | 0 |
| 19827.2045388 | 0.128 |
| 19843.5324727 | 0.014 |
| 19859.8614066 | -0.057 |
| 19876.1693388 | 0.241 |
| 19892.4792717 | -0.185 |
| 19908.7922048 | 0.057 |
| 19925.1011365 | 0.085 |
| 19941.4360702 | 0.454 |
| 19957.7690016 | -0.255 |
| 19974.0789339 | 0.028 |
| 19990.3988651 | 0.17 |
| 20006.7417988 | 0.227 |
| 20023.1047347 | -0.156 |
| 20039.434667 | 0.284 |
| 20055.757599 | 0.142 |
| 20072.1035328 | 0.043 |
| 20088.4164658 | -0.028 |
| 20104.724398 | -0.099 |
| 20121.0313302 | -0.028 |
| 20137.3792641 | -0.043 |
| 20153.7491999 | 0.085 |
| 20170.0711323 | -0.17 |
| 20186.396066 | -0.014 |
| 20202.7029976 | -0.028 |
| 20219.0169302 | -0.114 |
| 20235.3308633 | -0.156 |
| 20251.6687978 | 0.17 |
| 20268.0337332 | -0.341 |
| 20284.3556668 | 0.114 |
| 20300.6916011 | 0.142 |
| 20317.0075344 | 0.227 |
| 20333.313467 | -0.057 |
| 20349.6443994 | -0.185 |
| 20365.9873336 | 0.156 |
| 20382.3072659 | -0.241 |
| 20398.6401996 | 0.014 |
| 20414.9591324 | 0.213 |
| 20431.2700642 | 0.142 |
| 20447.6029962 | 0.057 |
| 20463.9119273 | -0.043 |
| 20480.2288595 | 0.17 |
| 20496.5547933 | -0.099 |
| 20512.8787258 | 0.114 |
| 20529.2166598 | -0.085 |
| 20545.5395928 | -0.071 |
| 20561.8695268 | 0.397 |
| 20578.1794592 | -0.057 |
| 20594.5123933 | -0.213 |
| 20610.8253258 | -0.199 |
| 20627.1482589 | -0.028 |
| 20643.4521909 | -0.128 |
| 20659.776124 | -0.241 |
| 20676.0800565 | 0.085 |
| 20692.3989899 | -0.142 |
| 20708.712923 | -0.028 |
| 20725.0338554 | 0.17 |
| 20741.3437883 | 0.057 |
| 20757.6597209 | -0.142 |
| 20773.9886543 | -0.057 |
| 20790.3285873 | 0.27 |
| 20806.6495202 | -0.014 |
| 20823.0164547 | 0.028 |
| 20839.334388 | -0.085 |
| 20855.6803229 | -0.085 |
| 20871.9982551 | 0.085 |
| 20888.3151867 | -0.099 |
| 20904.6541213 | -0.057 |
| 20920.9620529 | 0.043 |
| 20937.2909847 | 0.241 |
| 20953.6089158 | -0.255 |
| 20969.9328489 | -0.057 |
| 20986.2407816 | 0.043 |
| 21002.569715 | 0.043 |
| 21018.9056466 | -0.156 |
| 21035.2255789 | 0.028 |
| 21051.5665125 | -0.028 |
| 21067.8954464 | -0.156 |
| 21084.2133798 | 0.043 |
| 21100.5363134 | -0.099 |
| 21116.869247 | 0.099 |
| 21133.1921801 | 0.199 |
| 21149.5061121 | -0.043 |
| 21165.8300446 | 0.114 |
| 21182.1899804 | 0.199 |
| 21198.4999121 | 0.028 |
| 21214.8278455 | 0.028 |
| 21231.1377778 | 0.028 |
| 21247.4567101 | 0.142 |
| 21263.7746428 | -0.128 |
| 21280.0975753 | -0.128 |
| 21296.405507 | 0.213 |
| 21312.7234386 | -0.071 |
| 21329.0603708 | 0.241 |
| 21345.3743034 | -0.043 |
| 21361.7162375 | 0.227 |
| 21378.0611718 | 0.27 |
| 21394.3731048 | 0.213 |
| 21410.6950384 | 0.057 |
| 21427.0119711 | 0.156 |
| 21443.321904 | 0.099 |
| 21459.6508379 | -0.043 |
| 21475.9777712 | -0.014 |
| 21492.2947039 | 0.156 |
| 21508.6116367 | 0.27 |
| 21524.9275693 | -0.057 |
| 21541.2645037 | 0.114 |
| 21557.5874351 | 0.213 |
| 21573.9103654 | 0.142 |
| 21590.2362981 | 0.028 |
| 21606.5542314 | -0.156 |
| 21622.9071656 | 0.17 |
| 21639.2160984 | 0.014 |
| 21655.5310316 | 0.213 |
| 21671.8489649 | 0.043 |
| 21688.1628975 | -0.17 |
| 21704.46683 | 0.057 |
| 21720.7817632 | -0.099 |
| 21737.0986964 | 0.199 |
| 21753.4076276 | 0.085 |
| 21769.7255604 | 0.284 |
| 21786.051493 | -0.128 |
| 21802.3604236 | 0.057 |
| 21818.688357 | 0.185 |
| 21835.028291 | 0.17 |
| 21851.3572244 | 0.114 |
| 21867.6731559 | 0.057 |
| 21883.9840878 | 0.085 |
| 21900.3040212 | 0.014 |
| 21916.6129524 | -0.071 |
| 21932.9248848 | 0.014 |
| 21949.2468172 | -0.369 |
| 21965.5507481 | 0.426 |
| 21981.8986831 | -0.085 |
| 21998.2146158 | -0.312 |
| 22014.5285478 | -0.014 |
| 22030.8504808 | 0.099 |
| 22047.1674129 | 0.241 |
| 22063.4773453 | -0.085 |
| 22079.7982782 | 0.071 |
| 22096.0922096 | 0.043 |
| 22112.4321442 | 0.071 |
| 22128.7450772 | 0.17 |
| 22145.0690109 | 0.043 |
| 22161.3739435 | 0.185 |
| 22177.6858754 | -0.128 |
| 22194.0208091 | -0.085 |
| 22210.3307403 | 0.014 |
| 22226.663674 | 0.185 |
| 22242.9806072 | -0.114 |
| 22259.31854 | -0.014 |
| 22275.6514737 | 0.241 |
| 22291.9924078 | 0.284 |
| 22308.3303417 | -0.043 |
| 22324.6552737 | -0.199 |
| 22340.9862067 | 0.128 |
| 22357.3051395 | 0.085 |
| 22373.6440724 | -0.057 |
| 22389.949005 | 0.369 |
| 22406.2629381 | -0.312 |
| 22422.57587 | 0.014 |
| 22438.9008037 | 0.114 |
| 22455.2467381 | -0.099 |
| 22471.5596706 | 0.128 |
| 22487.8586017 | 0.185 |
| 22504.1725348 | 0.298 |
| 22520.4844667 | 0.142 |
| 22536.7953991 | 0.142 |
| 22553.1303317 | 0.128 |
| 22569.4332642 | -0.199 |
| 22585.7611964 | 0.057 |
| 22602.0821288 | -0.071 |
| 22618.3930617 | -0.043 |
| 22634.7099939 | -0.043 |
| 22651.0299274 | 0.014 |
| 22667.4138633 | 0.114 |
| 22683.736797 | 0.298 |
| 22700.0467298 | 0.241 |
| 22716.3916647 | -0.17 |
| 22732.7045978 | 0.114 |
| 22749.0295304 | 0.156 |
| 22765.3504622 | -0.057 |
| 22781.6673944 | -0.128 |
| 22797.9943277 | 0.043 |
| 22814.3102586 | -0.014 |
| 22830.6161907 | 0.099 |
| 22846.9351224 | 0.043 |
| 22863.2690561 | 0.043 |
| 22879.5859883 | 0.057 |
| 22895.9089214 | -0.17 |
| 22912.2238534 | 0.213 |
| 22928.5577876 | -0.199 |
| 22944.8847215 | -0.057 |
| 22961.190653 | 0.071 |
| 22977.5105859 | -0.099 |
| 22993.816518 | -0.028 |
| 23010.1424512 | 0.27 |
| 23026.4523836 | -0.17 |
| 23042.7943177 | -0.043 |
| 23059.1102509 | 0.014 |
| 23075.4271836 | 0.014 |
| 23091.7401161 | 0.071 |
| 23108.0740498 | 0.128 |
| 23124.3919809 | -0.014 |
| 23140.7189136 | 0.27 |
| 23157.0578476 | -0.185 |
| 23173.3767799 | 0.028 |
| 23189.690713 | 0.057 |
| 23206.0086463 | 0.326 |
| 23222.3275786 | -0.185 |
| 23238.6435107 | 0.028 |
| 23254.970444 | -0.043 |
| 23271.2903774 | -0.241 |
| 23287.6023104 | 0.128 |
| 23303.9212433 | -0.028 |
| 23320.2511773 | 0.043 |
| 23336.5861099 | -0.213 |
| 23352.9020426 | 0.099 |
| 23369.2139739 | 0.099 |
| 23385.5529067 | -0.114 |
| 23401.880839 | -0.014 |
| 23418.2077723 | -0.284 |
| 23434.5257056 | 0.014 |
| 23450.8416371 | 0.142 |
| 23467.1645702 | -0.185 |
| 23483.4735025 | -0.085 |
| 23499.7964361 | 0.043 |
| 23516.1123682 | 0.014 |
| 23532.4323011 | 0.114 |
| 23548.7902361 | -0.014 |
| 23565.1041692 | -0.028 |
| 23581.4511037 | -0.099 |
| 23597.7710366 | -0.128 |
| 23614.0959697 | -0.071 |
| 23630.4069027 | -0.099 |
| 23646.7738382 | 0.199 |
| 23663.0967707 | -0.043 |
| 23679.4147024 | -0.085 |
| 23695.7316346 | -0.028 |
| 23712.0495679 | -0.043 |
| 23728.3714987 | 0 |
| 23744.7124322 | 0.128 |
| 23761.0253647 | 0.199 |
| 23777.3592978 | 0.014 |
| 23793.679229 | -0.014 |
| 23810.0721661 | -0.071 |
| 23826.3980977 | -0.099 |
| 23842.7130297 | -0.142 |
| 23859.0439638 | -0.128 |
| 23875.3648956 | -0.142 |
| 23891.6988293 | 0.057 |
| 23908.0147608 | -0.028 |
| 23924.322693 | -0.185 |
| 23940.6406253 | 0.284 |
| 23956.9635578 | -0.043 |
| 23973.27249 | -0.326 |
| 23989.5964237 | -0.099 |
| 24005.9443587 | 0.043 |
| 24022.2552911 | -0.284 |
| 24038.5702237 | -0.043 |
| 24054.8841568 | 0.142 |
| 24071.2030902 | 0.085 |
| 24087.5210219 | -0.383 |
| 24103.8509537 | -0.085 |
| 24120.1908877 | 0.043 |
| 24136.5308217 | -0.099 |
| 24152.8497534 | 0.014 |
| 24169.1686863 | -0.156 |
| 24185.4896187 | -0.014 |
| 24201.7785498 | -0.142 |
| 24218.0964831 | -0.028 |
| 24234.4104151 | -0.085 |
| 24250.7283484 | -0.071 |
| 24267.050282 | -0.114 |
| 24283.3642134 | -0.114 |
| 24299.6831463 | -0.085 |
| 24316.000079 | -0.156 |
| 24332.3210119 | 0.27 |
| 24348.6389441 | 0.114 |
| 24364.9578764 | 0.028 |
| 24381.2938091 | 0.17 |
| 24397.614742 | 0.156 |
| 24413.9406758 | 0.043 |
| 24430.255609 | 0.156 |
| 24446.5995438 | -0.043 |
| 24462.9444787 | -0.142 |
| 24479.2564117 | -0.156 |
| 24495.5613443 | 0.156 |
| 24511.8642756 | -0.128 |
| 24528.1822084 | 0 |
| 24544.4961409 | -0.185 |
| 24560.8030731 | -0.071 |
| 24577.1200064 | -0.043 |
| 24593.4299381 | 0.028 |
| 24609.7528701 | 0.255 |
| 24626.0768037 | 0.27 |
| 24642.4037365 | 0.17 |
| 24658.7146688 | 0.071 |
| 24675.0306021 | -0.014 |
| 24691.3375342 | 0.27 |
| 24707.6464654 | 0.099 |
| 24723.954397 | -0.057 |
| 24740.3063312 | 0.014 |
| 24756.6232644 | -0.114 |
| 24772.9641974 | 0.043 |
| 24789.2761293 | 0.014 |
| 24805.5990629 | 0.128 |
| 24821.9309959 | 0.199 |
| 24838.2569291 | -0.043 |
| 24854.5788627 | 0.014 |
| 24870.8907951 | 0.128 |
| 24887.2087268 | 0.071 |
| 24903.5136594 | -0.014 |
| 24919.8275919 | 0.014 |
| 24936.1555242 | 0.114 |
| 24952.4734569 | 0.227 |
| 24968.8103908 | -0.128 |
| 24985.163325 | 0.142 |
| 25001.4652563 | 0.114 |
| 25017.7811895 | 0.185 |
| 25034.0891223 | 0.014 |
| 25050.4110553 | -0.099 |
| 25066.7639901 | 0.043 |
| 25083.0849225 | -0.085 |
| 25099.4078561 | -0.043 |
| 25115.7337876 | -0.057 |
| 25132.0387186 | -0.142 |
| 25148.3556513 | -0.057 |
| 25164.6715828 | -0.014 |
| 25180.9905157 | 0.043 |
| 25197.3134493 | -0.014 |
| 25213.6463835 | 0 |
| 25229.9623167 | 0.028 |
| 25246.2772493 | -0.085 |
| 25262.586181 | 0.057 |
| 25278.8981134 | 0.014 |
| 25295.212046 | 0.071 |
| 25311.5439795 | -0.014 |
| 25327.8729129 | 0.043 |
| 25344.179844 | 0.156 |
| 25360.4967772 | 0.071 |
| 25376.8137105 | 0.043 |
| 25393.1416444 | 0.213 |
| 25409.4675765 | 0.284 |
| 25425.8035098 | -0.028 |
| 25442.1454428 | 0.071 |
| 25458.470376 | -0.185 |
| 25474.7953092 | -0.085 |
| 25491.1272427 | 0.185 |
| 25507.4461756 | -0.043 |
| 25523.7681086 | -0.27 |
| 25540.0860413 | -0.085 |
| 25556.4259754 | -0.099 |
| 25572.7419075 | -0.043 |
| 25589.0478401 | 0.142 |
| 25605.359772 | 0.185 |
| 25621.6927062 | -0.17 |
| 25637.9976377 | 0 |
| 25654.3125703 | -0.241 |
| 25670.6075012 | 0.114 |
| 25686.9234333 | 0.114 |
| 25703.250366 | -0.156 |
| 25719.5642974 | -0.014 |
| 25735.8752304 | -0.028 |
| 25752.1851616 | 0.142 |
| 25768.5110954 | 0.227 |
| 25784.8850313 | 0.043 |
| 25801.2029635 | 0.043 |
| 25817.514896 | -0.085 |
| 25833.8288285 | -0.128 |
| 25850.1587614 | 0.014 |
| 25866.500695 | -0.014 |
| 25882.8286289 | -0.185 |
| 25899.1735632 | -0.114 |
| 25915.4904954 | -0.099 |
| 25931.8094282 | 0.114 |
| 25948.1193605 | -0.085 |
| 25964.4362933 | 0.071 |
| 25980.7532265 | 0.028 |
| 25997.0781597 | -0.057 |
| 26013.4200939 | -0.227 |
| 26029.7480272 | -0.043 |
| 26046.0699602 | 0.199 |
| 26062.3818915 | 0.099 |
| 26078.702825 | 0.142 |
| 26095.0277565 | 0.043 |
| 26111.3406879 | 0.099 |
| 26127.6606202 | -0.028 |
| 26143.9905531 | -0.369 |
| 26160.2954852 | 0.114 |
| 26176.6124184 | 0.114 |
| 26192.9323513 | 0.028 |
| 26209.2482834 | -0.185 |
| 26225.5622165 | -0.071 |
| 26241.8671491 | -0.326 |
| 26258.1790816 | 0.043 |
| 26274.4940125 | -0.156 |
| 26290.824946 | -0.355 |
| 26307.1468785 | 0.17 |
| 26323.4748118 | -0.312 |
| 26339.8027457 | -0.028 |
| 26356.1516808 | -0.227 |
| 26372.4616137 | 0.241 |
| 26388.7805454 | -0.128 |
| 26405.1024778 | -0.014 |
| 26421.4364104 | -0.17 |
| 26437.7553438 | -0.114 |
| 26454.0642749 | -0.114 |
| 26470.3732072 | -0.27 |
| 26486.7021412 | 0 |
| 26503.0460749 | 0.099 |
| 26519.3810086 | 0 |
| 26535.6839405 | -0.114 |
| 26551.995873 | 0.142 |
| 26568.3138052 | 0.099 |
| 26584.6347376 | 0.014 |
| 26600.9626704 | 0.156 |
| 26617.2876041 | -0.114 |
| 26633.6025361 | -0.057 |
| 26649.9054675 | 0.085 |
| 26666.2143998 | 0.142 |
| 26682.5413325 | 0.028 |
| 26698.8512642 | -0.156 |
| 26715.1631967 | 0.142 |
| 26731.4761297 | 0.014 |
| 26747.786062 | -0.043 |
| 26764.1269961 | -0.071 |
| 26780.4689303 | -0.114 |
| 26796.8008627 | -0.185 |
| 26813.1167954 | 0.071 |
| 26829.4257271 | -0.085 |
| 26845.7436604 | -0.142 |
| 26862.0565929 | -0.114 |
| 26878.3875264 | -0.199 |
| 26894.7134591 | -0.043 |
| 26911.0433915 | -0.043 |
| 26927.3663234 | -0.199 |
| 26943.689257 | 0.17 |
| 26959.9861886 | -0.085 |
| 26976.3021213 | 0.043 |
| 26992.6190534 | 0.071 |
| 27008.9329865 | -0.142 |
| 27025.2459184 | -0.142 |
| 27041.5638507 | -0.298 |
| 27057.8717834 | 0.114 |
| 27074.2017169 | -0.085 |
| 27090.5316503 | -0.185 |
| 27106.8555835 | -0.028 |
| 27123.1725162 | -0.114 |
| 27139.4934491 | 0.014 |
| 27155.8043815 | -0.142 |
| 27172.1183146 | -0.199 |
| 27188.4412471 | 0.028 |
| 27204.7641791 | -0.057 |
| 27221.0881122 | 0.085 |
| 27237.3970439 | 0 |
| 27253.7239772 | -0.156 |
| 27270.0379103 | -0.014 |
| 27286.3758447 | 0 |
| 27302.7017774 | 0.17 |
| 27319.0107086 | 0.014 |
| 27335.3706432 | 0.185 |
| 27351.6835757 | -0.142 |
| 27368.0225091 | 0.043 |
| 27384.3394418 | 0 |
| 27400.6643739 | 0.071 |
| 27416.996308 | -0.156 |
| 27433.3162409 | 0.099 |
| 27449.6381733 | -0.213 |
| 27465.9601063 | 0.298 |
| 27482.2820393 | -0.028 |
| 27498.6329746 | -0.128 |
| 27514.9629069 | 0.142 |
| 27531.3248422 | -0.17 |
| 27547.6967769 | 0.227 |
| 27564.0037091 | 0.199 |
| 27580.324642 | -0.114 |
| 27596.6355727 | -0.028 |
| 27612.9465029 | -0.071 |
| 27629.2504354 | -0.085 |
| 27645.5653686 | -0.185 |
| 27661.8823013 | -0.014 |
| 27678.1862327 | -0.057 |
| 27694.496165 | -0.156 |
| 27710.8180975 | -0.298 |
| 27727.1330295 | -0.014 |
| 27743.4419618 | -0.27 |
| 27759.7728953 | 0.142 |
| 27776.0918281 | -0.085 |
| 27792.4547629 | -0.071 |
| 27808.7716951 | 0.114 |
| 27825.0856259 | 0.071 |
| 27841.4195591 | -0.27 |
| 27857.7404914 | 0.227 |
| 27874.0564241 | -0.057 |
| 27890.3623556 | -0.014 |
| 27906.7122897 | -0.028 |
| 27923.0612226 | 0.043 |
| 27939.4011549 | -0.241 |
| 27955.7280876 | -0.27 |
| 27972.0420202 | 0.156 |
| 27988.3759528 | 0.156 |
| 28004.6938855 | -0.142 |
| 28021.0038167 | 0.071 |
| 28037.3127484 | -0.057 |
| 28053.6226813 | 0.298 |
| 28069.9416147 | 0.156 |
| 28086.2825482 | 0 |
| 28102.5984803 | -0.199 |
| 28118.9064131 | -0.114 |
| 28135.2293467 | -0.156 |
| 28151.5352777 | 0.028 |
| 28167.8602103 | -0.255 |
| 28184.1781436 | 0.156 |
| 28200.489076 | -0.355 |
| 28216.7990089 | 0.114 |
| 28233.1149416 | 0 |
| 28249.4458745 | -0.156 |
| 28265.768807 | -0.298 |
| 28282.0937402 | 0.099 |
| 28298.4136731 | -0.028 |
| 28314.7436071 | -0.014 |
| 28331.0675397 | -0.071 |
| 28347.3844713 | 0.057 |
| 28363.7204051 | -0.142 |
| 28380.0593396 | -0.142 |
| 28396.3902731 | -0.142 |
| 28412.6932056 | -0.156 |
| 28429.0391405 | 0.014 |
| 28445.352073 | 0 |
| 28461.6510041 | 0.099 |
| 28477.9589352 | 0.057 |
| 28494.2778675 | -0.028 |
| 28510.5878004 | 0.099 |
| 28526.9027324 | -0.057 |
| 28543.2256644 | -0.312 |
| 28559.5365967 | -0.028 |
| 28575.8685298 | -0.043 |
| 28592.2264631 | 0 |
| 28608.5433964 | -0.043 |
| 28624.8573284 | -0.014 |
| 28641.1912621 | -0.227 |
| 28657.5081943 | 0.355 |
| 28673.8301267 | 0.284 |
| 28690.1550582 | -0.142 |
| 28706.5139939 | -0.255 |
| 28722.8269253 | 0.255 |
| 28739.1678577 | 0.17 |
| 28755.4827903 | 0 |
| 28771.837724 | 0.043 |
| 28788.1736578 | -0.043 |
| 28804.4865898 | -0.17 |
| 28820.7995212 | -0.298 |
| 28837.1244543 | -0.185 |
| 28853.4513876 | -0.341 |
| 28869.7613205 | 0.114 |
| 28886.0712522 | -0.099 |
| 28902.4181872 | -0.043 |
| 28918.7471201 | -0.085 |
| 28935.0710532 | -0.014 |
| 28951.3749846 | -0.156 |
| 28967.6879177 | 0.014 |
| 28984.0068505 | -0.27 |
| 29000.3307831 | -0.028 |
| 29016.6557157 | -0.199 |
| 29032.9956503 | 0.014 |
| 29049.3265838 | -0.213 |
| 29065.6445171 | -0.128 |
| 29081.971451 | -0.043 |
| 29098.2903832 | -0.241 |
| 29114.598316 | -0.298 |
| 29130.9102484 | 0.142 |
| 29147.2381818 | -0.085 |
| 29163.5941173 | -0.085 |
| 29179.9120501 | 0.014 |
| 29196.2459821 | -0.085 |
| 29212.5799158 | 0.128 |
| 29228.8998492 | 0.057 |
| 29245.2097815 | -0.199 |
| 29261.5287127 | 0.185 |
| 29277.8466449 | 0.128 |
| 29294.1655772 | 0.17 |
| 29310.4925093 | -0.014 |
| 29326.8024417 | 0.043 |
| 29343.1343758 | 0.185 |
| 29359.4763094 | 0.142 |
| 29375.7992424 | 0.128 |
| 29392.1071741 | 0.014 |
| 29408.4221061 | 0.17 |
| 29424.7630408 | 0.043 |
| 29441.0729737 | 0 |
| 29457.3869062 | 0 |
| 29473.7128383 | 0.099 |
| 29490.0247713 | -0.17 |
| 29506.3417046 | -0.028 |
| 29522.6816381 | -0.114 |
| 29539.0015709 | 0.028 |
| 29555.3175042 | -0.17 |
| 29571.6384377 | 0.199 |
| 29587.9563704 | 0.17 |
| 29604.315305 | 0.114 |
| 29620.6322383 | -0.071 |
| 29636.9471703 | -0.014 |
| 29653.2581033 | -0.043 |
| 29669.5870367 | 0.397 |
| 29685.92397 | 0.071 |
| 29702.2409027 | 0.014 |
| 29718.5468342 | 0.114 |
| 29734.8987689 | 0.142 |
| 29751.2027009 | 0.085 |
| 29767.516634 | 0.156 |
| 29783.8785699 | 0.255 |
| 29800.2055031 | 0.043 |
| 29816.5264366 | 0.043 |
| 29832.8373696 | 0.426 |
| 29849.1683031 | 0.014 |
| 29865.4842358 | 0.213 |
| 29881.8061682 | 0.043 |
| 29898.144101 | 0.128 |
| 29914.4580336 | -0.128 |
| 29930.7799654 | 0.369 |
| 29947.1168987 | 0.085 |
| 29963.4578328 | 0.085 |
| 29979.7757645 | 0.099 |
| 29996.0946973 | 0.085 |
| 30012.3986293 | -0.27 |
| 30028.7295617 | 0.043 |
| 30045.0424936 | -0.085 |
| 30061.3714276 | 0.142 |
| 30077.7083598 | 0.028 |
| 30094.0152914 | -0.014 |
| 30110.3622258 | 0.043 |
| 30126.6841594 | -0.128 |
| 30142.9970918 | -0.114 |
| 30159.3310261 | -0.071 |
| 30175.6369587 | 0.284 |
| 30191.9448898 | -0.028 |
| 30208.2618231 | 0.213 |
| 30224.584755 | -0.099 |
| 30240.8996865 | -0.27 |
| 30257.2196194 | 0.227 |
| 30273.5285511 | -0.213 |
| 30289.8454838 | -0.014 |
| 30306.1714171 | 0.185 |
| 30322.4843496 | -0.085 |
| 30338.8012828 | 0.043 |
| 30355.1112157 | 0.028 |
| 30371.4341471 | -0.142 |
| 30387.7490797 | 0.128 |
| 30404.0690126 | -0.199 |
| 30420.3889455 | -0.17 |
| 30436.6978783 | 0 |
| 30453.0388124 | -0.099 |
| 30469.3567452 | -0.142 |
| 30485.6846791 | -0.17 |
| 30502.0036125 | 0.014 |
| 30518.3165438 | 0.014 |
| 30534.6504764 | 0.355 |
| 30550.9804093 | -0.043 |
| 30567.3033412 | 0.255 |
| 30583.6192739 | 0.028 |
| 30599.9432054 | 0.071 |
| 30616.2511381 | 0.156 |
| 30632.56307 | 0.071 |
| 30648.8750013 | 0.483 |
| 30665.2229363 | -0.142 |
| 30681.5338682 | 0.426 |
| 30697.8527999 | 0.099 |
| 30714.1737328 | 0.241 |
| 30730.5016667 | -0.085 |
| 30746.8436014 | 0 |
| 30763.1655339 | 0.241 |
| 30779.4804648 | -0.043 |
| 30795.8003977 | 0.156 |
| 30812.1193305 | 0.099 |
| 30828.4422636 | -0.028 |
| 30844.7691974 | 0.341 |
| 30861.07413 | 0.241 |
| 30877.3920622 | -0.028 |
| 30893.7099945 | 0.213 |
| 30910.0429281 | 0.114 |
| 30926.3648611 | 0.185 |
| 30942.6767935 | 0.014 |
| 30958.9917267 | 0.199 |
| 30975.3246603 | 0.383 |
| 30991.6425931 | -0.071 |
| 31007.9825271 | 0.057 |
| 31024.3014605 | -0.085 |
| 31040.6093922 | 0.255 |
| 31056.9323252 | 0.17 |
| 31073.2832593 | 0.099 |
| 31089.6641957 | -0.071 |
| 31105.9911279 | 0.128 |
| 31122.3470623 | -0.014 |
| 31138.7059968 | 0 |
| 31155.0749297 | 0.085 |
| 31171.3868616 | -0.099 |
| 31187.7387969 | 0.156 |
| 31204.0947318 | 0.128 |
| 31220.4036641 | 0.128 |
| 31236.7275978 | 0.028 |
| 31253.0385307 | 0.071 |
| 31269.3514637 | -0.028 |
| 31285.6753952 | 0.085 |
| 31301.9913284 | 0.255 |
| 31318.3172622 | 0.099 |
| 31334.6521959 | -0.142 |
| 31350.9841301 | 0.099 |
| 31367.3000611 | 0 |
| 31383.6239936 | 0.355 |
| 31399.9389268 | 0.312 |
| 31416.2848606 | 0.128 |
| 31432.5947935 | -0.028 |
| 31448.907726 | 0.128 |
| 31465.230659 | 0.27 |
| 31481.5485918 | -0.043 |
| 31497.8605237 | 0.057 |
| 31514.1894565 | 0.071 |
| 31530.5043886 | -0.071 |
| 31546.8163204 | -0.099 |
| 31563.1422537 | 0.227 |
| 31579.4851879 | 0.014 |
| 31595.7931178 | 0.099 |
| 31612.1150508 | 0.043 |
| 31628.4279822 | 0.099 |
| 31644.7609153 | 0.369 |
| 31661.0758484 | 0.298 |
| 31677.3977798 | 0.213 |
| 31693.740714 | 0.241 |
| 31710.0476467 | 0.185 |
| 31726.3705786 | 0 |
| 31742.6875108 | -0.028 |
| 31759.0524457 | -0.071 |
| 31775.3683789 | 0.326 |
| 31791.7243144 | 0.355 |
| 31808.0762497 | 0.114 |
| 31824.3881827 | 0.128 |
| 31840.7181161 | -0.241 |
| 31857.0460489 | -0.156 |
| 31873.3599815 | 0.028 |
| 31889.6979137 | 0.028 |
| 31906.0048464 | -0.071 |
| 31922.3207796 | 0.312 |
| 31938.6447128 | 0.341 |
| 31954.9626461 | 0.156 |
| 31971.2985788 | 0.326 |
| 31987.6095106 | 0.043 |
| 32003.9284423 | 0.27 |
| 32020.2383752 | -0.043 |
| 32036.5663091 | 0.028 |
| 32052.8882415 | 0.199 |
| 32069.2071738 | 0.099 |
| 32085.5251055 | 0.17 |
| 32101.8400375 | 0.199 |
| 32118.1539706 | 0.028 |
| 32134.4959042 | 0.227 |
| 32150.803837 | 0.454 |
| 32167.1187701 | 0.085 |
| 32183.4417032 | 0.255 |
| 32199.7716361 | 0.014 |
| 32216.0875671 | 0.142 |
| 32232.3994973 | 0.284 |
| 32248.7294296 | 0 |
| 32265.0373613 | 0.284 |
| 32281.3592948 | 0.043 |
| 32297.7122296 | 0.142 |
| 32314.0561633 | 0 |
| 32330.367094 | -0.028 |
| 32346.7090282 | 0.028 |
| 32363.0239608 | 0.255 |
| 32379.3498945 | -0.284 |
| 32395.6558266 | 0.284 |
| 32411.98476 | 0.071 |
| 32428.2916916 | 0.369 |
| 32444.6056247 | 0.27 |
| 32460.9255576 | 0.326 |
| 32477.2414903 | -0.114 |
| 32493.5604237 | 0.085 |
| 32509.8723567 | -0.057 |
| 32526.1992899 | -0.128 |
| 32542.5452249 | -0.128 |
| 32558.8571573 | 0.27 |
| 32575.1760907 | 0.071 |
| 32591.4980231 | 0.284 |
| 32607.7969548 | 0.298 |
| 32624.1318891 | 0.312 |
| 32640.4548222 | 0.057 |
| 32656.7637539 | 0.213 |
| 32673.0806872 | 0.156 |
| 32689.4016207 | 0.341 |
| 32705.723552 | 0.142 |
| 32722.0414837 | 0.213 |
| 32738.3634161 | 0.156 |
| 32754.6763486 | 0.156 |
| 32771.0072821 | -0.057 |
| 32787.3192146 | 0.199 |
| 32803.6271468 | 0.213 |
| 32819.9420777 | 0.355 |
| 32836.2720106 | 0.028 |
| 32852.6029435 | 0.199 |
| 32868.9308769 | 0.099 |
| 32885.2608109 | -0.028 |
| 32901.5677425 | -0.099 |
| 32917.8946752 | 0.185 |
| 32934.230609 | -0.085 |
| 32950.5475418 | 0.156 |
| 32966.8824761 | 0.17 |
| 32983.2004088 | 0.156 |
| 32999.5173415 | 0.341 |
| 33015.830274 | 0.241 |
| 33032.154206 | 0.255 |
| 33048.49314 | 0.241 |
| 33064.8330724 | 0.185 |
| 33081.1550059 | 0.114 |
| 33097.469938 | -0.014 |
| 33113.7878713 | 0.17 |
| 33130.0968025 | 0.241 |
| 33146.4027351 | 0.17 |
| 33162.7146675 | 0.099 |
| 33179.0436015 | 0.142 |
| 33195.3575346 | -0.128 |
| 33211.6734673 | 0.298 |
| 33227.9944002 | -0.043 |
| 33244.3403351 | -0.057 |
| 33260.6552683 | 0.043 |
| 33276.9822021 | 0.17 |
| 33293.3121356 | 0.156 |
| 33309.6260681 | 0.057 |
| 33325.9580017 | 0.17 |
| 33342.2909342 | 0.483 |
| 33358.618867 | -0.014 |
| 33374.9247991 | 0.213 |
| 33391.2567321 | 0.014 |
| 33407.5486629 | -0.071 |
| 33423.890597 | 0.114 |
| 33440.2265308 | 0.057 |
| 33456.5314628 | 0.241 |
| 33472.8513957 | 0.213 |
| 33489.1653283 | -0.057 |
| 33505.5022621 | 0.099 |
| 33521.8111933 | 0.213 |
| 33538.1131251 | 0.185 |
| 33554.426056 | 0.014 |
| 33570.7309885 | 0.199 |
| 33587.1079247 | 0.284 |
| 33603.4208577 | 0.014 |
| 33619.7597912 | 0.156 |
| 33636.1167256 | 0.27 |
| 33652.4206565 | 0.312 |
| 33668.7325889 | 0.114 |
| 33685.0445213 | 0.185 |
| 33701.3674538 | 0.057 |
| 33717.6683851 | -0.057 |
| 33733.981317 | 0.028 |
| 33750.3322517 | 0.057 |
| 33766.6571843 | 0.227 |
| 33782.9701162 | -0.043 |
| 33799.3140505 | 0.043 |
| 33815.6399837 | 0.17 |
| 33831.9779182 | 0.369 |
| 33848.2928497 | 0.156 |
| 33864.6137832 | 0.185 |
| 33880.9247161 | 0.17 |
| 33897.286652 | 0.085 |
| 33913.6095839 | -0.114 |
| 33929.9475178 | 0.582 |
| 33946.2674513 | -0.057 |
| 33962.592385 | 0.014 |
| 33978.8983176 | -0.057 |
| 33995.2172499 | 0.185 |
| 34011.5581846 | 0.057 |
| 34027.8831166 | 0.241 |
| 34044.194049 | 0.114 |
| 34060.5189827 | 0.199 |
| 34076.8329158 | -0.085 |
| 34093.1618498 | 0.142 |
| 34109.4647817 | 0.114 |
| 34125.7987154 | -0.312 |
| 34142.1526502 | 0.028 |
| 34158.4865845 | -0.028 |
| 34174.8015165 | 0.27 |
| 34191.1134484 | 0.27 |
| 34207.4303806 | 0.014 |
| 34223.762313 | 0.213 |
| 34240.1062467 | 0.156 |
| 34256.4671825 | 0.114 |
| 34272.7691149 | -0.014 |
| 34289.1220497 | 0.17 |
| 34305.4359823 | 0.241 |
| 34321.7839167 | 0.071 |
| 34338.0898483 | -0.142 |
| 34354.4127813 | 0 |
| 34370.7287134 | 0.099 |
| 34387.0336455 | -0.071 |
| 34403.364579 | 0.114 |
| 34419.7005128 | -0.043 |
| 34436.0164449 | 0.099 |
| 34452.3333776 | -0.071 |
| 34468.6643111 | -0.043 |
| 34484.9742434 | 0.043 |
| 34501.3401784 | 0.213 |
| 34517.6671106 | -0.043 |
| 34533.969043 | 0.156 |
| 34550.2859757 | 0.213 |
| 34566.5809077 | -0.043 |
| 34582.8958398 | 0.128 |
| 34599.2337737 | -0.085 |
| 34615.5487069 | 0.185 |
| 34631.8606382 | -0.255 |
| 34648.1785704 | 0.156 |
| 34664.4885027 | 0.185 |
| 34680.8144365 | -0.142 |
| 34697.1493691 | 0.043 |
| 34713.4733011 | 0.028 |
| 34729.7982343 | 0.298 |
| 34746.1141675 | -0.099 |
| 34762.4220997 | -0.028 |
| 34778.7310314 | 0.014 |
| 34795.0719655 | -0.099 |
| 34811.3908978 | -0.156 |
| 34827.724832 | 0 |
| 34844.0447632 | -0.199 |
| 34860.3746962 | -0.156 |
| 34876.6726283 | -0.114 |
| 34892.9855603 | -0.085 |
| 34909.3154937 | -0.014 |
| 34925.6324259 | 0.199 |
| 34941.9433588 | -0.185 |
| 34958.2592915 | -0.298 |
| 34974.5772248 | -0.028 |
| 34990.8881566 | -0.128 |
| 35007.2180906 | 0.014 |
| 35023.5400231 | 0.071 |
| 35039.8609566 | -0.17 |
| 35056.1668881 | -0.213 |
| 35072.4838214 | -0.284 |
| 35088.7977517 | 0.043 |
| 35105.1246844 | 0.071 |
| 35121.4576186 | 0.057 |
| 35137.7635502 | -0.241 |
| 35154.0984845 | -0.156 |
| 35170.4174167 | -0.454 |
| 35186.75335 | -0.213 |
| 35203.0552819 | -0.028 |
| 35219.3672143 | -0.326 |
| 35235.6811463 | -0.142 |
| 35251.9980784 | 0.014 |
| 35268.3090114 | -0.028 |
| 35284.6159441 | -0.255 |
| 35300.9218762 | -0.071 |
| 35317.2288072 | 0.071 |
| 35333.521738 | -0.128 |
| 35349.8276695 | 0.255 |
| 35366.1616021 | -0.028 |
| 35382.5055363 | 0 |
| 35398.8184694 | -0.099 |
| 35415.1364027 | -0.227 |
| 35431.4543349 | 0.128 |
| 35447.7692664 | 0.028 |
| 35464.0841985 | -0.099 |
| 35480.4031302 | -0.057 |
| 35496.7190623 | 0.185 |
| 35513.0529965 | -0.071 |
| 35529.374929 | -0.383 |
| 35545.6848607 | 0.057 |
| 35562.0167943 | 0.014 |
| 35578.3387262 | 0.199 |
| 35594.6456589 | -0.17 |
| 35610.980591 | -0.085 |
| 35627.3025229 | 0.014 |
| 35643.6184538 | -0.185 |
| 35659.9193856 | -0.241 |
| 35676.2373167 | 0.241 |
| 35692.5602498 | 0.227 |
| 35708.8751819 | -0.255 |
| 35725.1881138 | -0.142 |
| 35741.5010457 | 0.156 |
| 35757.818979 | -0.114 |
| 35774.1269112 | 0.114 |
| 35790.4448446 | -0.128 |
| 35806.7597744 | 0.185 |
| 35823.0817074 | -0.114 |
| 35839.3936387 | 0 |
| 35855.7175713 | -0.028 |
| 35872.0535056 | 0.028 |
| 35888.392439 | 0.185 |
| 35904.6983711 | 0.071 |
| 35921.0623054 | -0.014 |
| 35937.3852379 | 0.185 |
| 35953.7171709 | -0.326 |
| 35970.0421047 | -0.085 |
| 35986.3740383 | -0.185 |
| 36002.6829711 | 0.071 |
| 36019.0009044 | 0.17 |
| 36035.3198367 | 0.142 |
| 36051.6337675 | -0.185 |
| 36067.9577001 | -0.199 |
| 36084.279632 | 0.057 |
| 36100.6245663 | -0.284 |
| 36116.9725014 | 0.199 |
| 36133.3174357 | -0.142 |
| 36149.6353673 | 0.17 |
| 36165.9492993 | 0 |
| 36182.2732308 | 0.028 |
| 36198.5911635 | -0.284 |
| 36214.9090963 | -0.426 |
| 36231.217028 | -0.17 |
| 36247.5329601 | 0.014 |
| 36263.8658931 | 0.057 |
| 36280.1758255 | -0.014 |
| 36296.51476 | -0.057 |
| 36312.8306921 | 0.057 |
| 36329.1656258 | -0.156 |
| 36345.4865582 | -0.213 |
| 36361.8094913 | 0.128 |
| 36378.1114231 | 0.043 |
| 36394.4303565 | 0.071 |
| 36410.7542902 | -0.057 |
| 36427.0742225 | -0.241 |
| 36443.386155 | -0.014 |
| 36459.7390903 | 0.043 |
| 36476.073024 | -0.028 |
| 36492.3869571 | 0.071 |
| 36508.7078895 | -0.142 |
| 36525.0478235 | -0.312 |
| 36541.3747568 | -0.114 |
| 36557.7256915 | -0.099 |
| 36574.0486251 | 0.028 |
| 36590.3595575 | 0.085 |
| 36606.6644901 | -0.099 |
| 36622.968422 | 0 |
| 36639.2733535 | -0.099 |
| 36655.5972861 | -0.213 |
| 36671.9052188 | 0.071 |
| 36688.2301509 | -0.057 |
| 36704.5560847 | 0.185 |
| 36720.8710167 | 0.114 |
| 36737.1719485 | 0.412 |
| 36753.4968817 | 0.114 |
| 36769.8138144 | -0.057 |
| 36786.1797505 | 0.199 |
| 36802.5426864 | 0.057 |
| 36818.8436176 | -0.27 |
| 36835.1685508 | -0.128 |
| 36851.4714827 | 0.185 |
| 36867.8044169 | 0.185 |
| 36884.1113496 | 0.043 |
| 36900.4502836 | 0.185 |
| 36916.7752168 | -0.241 |
| 36933.0961503 | 0.128 |
| 36949.4010818 | 0 |
| 36965.7070138 | 0.028 |
| 36982.0069461 | -0.185 |
| 36998.3198781 | -0.028 |
| 37014.639811 | -0.099 |
| 37030.9967454 | 0.071 |
| 37047.3026769 | 0.213 |
| 37063.643611 | -0.185 |
| 37079.9735428 | -0.213 |
| 37096.2864747 | 0.043 |
| 37112.5834052 | -0.057 |
| 37128.8833369 | -0.071 |
| 37145.1732676 | 0.298 |
| 37161.4821987 | 0.255 |
| 37177.8051306 | -0.014 |
| 37194.1070631 | -0.156 |
| 37210.4229963 | 0.099 |
| 37226.7189278 | 0.341 |
| 37243.0668612 | 0 |
| 37259.3617921 | -0.369 |
| 37275.6697248 | 0.028 |
| 37291.9626567 | -0.043 |
| 37308.2915885 | 0.185 |
| 37324.6355233 | 0.156 |
| 37340.9544556 | -0.028 |
| 37357.2613866 | -0.028 |
| 37373.5963209 | 0.071 |
| 37389.9162538 | 0.142 |
| 37406.2291863 | 0.014 |
| 37422.547119 | 0.057 |
| 37438.8570514 | 0.028 |
| 37455.172984 | -0.326 |
| 37471.4749159 | -0.028 |
| 37487.7778484 | -0.142 |
| 37504.1057811 | -0.227 |
| 37520.4257146 | 0.312 |
| 37536.7626473 | 0.17 |
| 37553.0925808 | 0.128 |
| 37569.4395152 | -0.043 |
| 37585.7504476 | 0.043 |
| 37602.0643807 | -0.227 |
| 37618.3703134 | -0.043 |
| 37634.6802457 | -0.057 |
| 37651.0131799 | 0.071 |
| 37667.3411115 | 0.099 |
| 37683.6420433 | -0.199 |
| 37699.9529757 | 0 |
| 37716.2709079 | 0.227 |
| 37732.6038399 | 0.114 |
| 37748.9417744 | 0.085 |
| 37765.2657069 | -0.014 |
| 37781.5826402 | -0.057 |
| 37797.8885723 | 0.199 |
| 37814.1905041 | -0.028 |
| 37830.5084369 | 0.17 |
| 37846.8373692 | 0.043 |
| 37863.1573027 | 0.057 |
| 37879.4852349 | 0.043 |
| 37895.8111681 | 0.241 |
| 37912.1171008 | -0.099 |
| 37928.4340329 | -0.085 |
| 37944.7559659 | 0.014 |
| 37961.0678967 | 0.114 |
| 37977.3838293 | 0.142 |
| 37993.7427639 | 0.057 |
| 38010.0786977 | -0.085 |
| 38026.4076306 | 0.185 |
| 38042.7435644 | 0.043 |
| 38059.0644967 | 0.057 |
| 38075.3694271 | 0.028 |
| 38091.7023602 | 0.043 |
| 38108.0342938 | -0.057 |
| 38124.3492264 | -0.099 |
| 38140.6751596 | 0.028 |
| 38156.9830912 | -0.114 |
| 38173.2980238 | 0.142 |
| 38189.6289579 | 0.114 |
| 38205.9448895 | -0.227 |
| 38222.2868242 | 0.156 |
| 38238.6087572 | -0.043 |
| 38254.9206902 | -0.071 |
| 38271.2416231 | 0.099 |
| 38287.5645562 | -0.043 |
| 38303.8894882 | -0.128 |
| 38320.1924196 | 0.284 |
| 38336.5033519 | -0.085 |
| 38352.8282851 | 0.156 |
| 38369.1362173 | 0.028 |
| 38385.4611488 | 0.341 |
| 38401.7970826 | 0.085 |
| 38418.1140131 | 0.014 |
| 38434.4579474 | -0.17 |
| 38450.7798804 | -0.057 |
| 38467.0858114 | -0.142 |
| 38483.4267449 | 0.27 |
| 38499.7446777 | 0.284 |
| 38516.0646105 | 0.156 |
| 38532.394544 | 0 |
| 38548.6984754 | -0.114 |
| 38565.020409 | -0.057 |
| 38581.3553422 | -0.028 |
| 38597.6642739 | -0.028 |
| 38613.9902071 | -0.085 |
| 38630.2931385 | -0.085 |
| 38646.6100706 | 0.043 |
| 38662.9460044 | 0.128 |
| 38679.251936 | 0.057 |
| 38695.6028712 | -0.114 |
| 38711.9288044 | -0.014 |
| 38728.2637382 | 0.185 |
| 38744.5746705 | 0.142 |
| 38760.8916021 | 0.199 |
| 38777.2035346 | 0.199 |
| 38793.5114651 | -0.043 |
| 38809.8283984 | 0.014 |
| 38826.1423315 | -0.17 |
| 38842.4512643 | 0.114 |
| 38858.7891976 | 0.071 |
| 38875.1031296 | -0.255 |
| 38891.4190623 | -0.128 |
| 38907.7309947 | 0.085 |
| 38924.0619282 | 0.043 |
| 38940.3768603 | -0.17 |
| 38956.6927924 | -0.071 |
| 38973.0207257 | 0.099 |
| 38989.347659 | -0.128 |
| 39005.6545912 | 0.014 |
| 39021.9825245 | 0.227 |
| 39038.2964571 | 0.014 |
| 39054.625391 | 0.085 |
| 39070.9453228 | 0.028 |
| 39087.2432533 | -0.043 |
| 39103.5321844 | 0.085 |
| 39119.8341152 | -0.043 |
| 39136.1340464 | 0.014 |
| 39152.4499785 | -0.142 |
| 39168.7799125 | -0.043 |
| 39185.075844 | -0.071 |
| 39201.4097771 | 0.057 |
| 39217.7197094 | 0.028 |
| 39234.0256415 | 0.043 |
| 39250.3475745 | -0.028 |
| 39266.6735078 | 0.057 |
| 39282.97244 | 0.142 |
| 39299.3023735 | -0.27 |
| 39315.615306 | -0.213 |
| 39331.95524 | 0.199 |
| 39348.2731728 | -0.128 |
| 39364.5951058 | 0.114 |
| 39380.9180383 | 0.213 |
| 39397.2229709 | -0.114 |
| 39413.5429032 | 0.227 |
| 39429.9168397 | 0.014 |
| 39446.2267709 | 0.071 |
| 39462.5467033 | 0.057 |
| 39478.8576362 | -0.014 |
| 39495.176569 | -0.099 |
| 39511.4995026 | -0.057 |
| 39527.8324352 | -0.071 |
| 39544.1463683 | 0.057 |
| 39560.4643005 | -0.071 |
| 39576.7812326 | -0.114 |
| 39593.0991654 | -0.028 |
| 39609.4120968 | 0.085 |
| 39625.7450304 | -0.156 |
| 39642.0659634 | 0.142 |
| 39658.3978975 | -0.043 |
| 39674.7078304 | 0.057 |
| 39691.015762 | 0.043 |
| 39707.3396957 | -0.043 |
| 39723.6396269 | 0.028 |
| 39739.9785614 | 0.142 |
| 39756.3004916 | 0.085 |
| 39772.6254242 | 0.284 |
| 39788.9343554 | 0.27 |
| 39805.2692897 | -0.17 |
| 39821.5922216 | -0.028 |
| 39837.9051547 | -0.227 |
| 39854.2180877 | 0.185 |
| 39870.5300202 | -0.028 |
| 39886.8739544 | 0.142 |
| 39903.1948868 | 0.028 |
| 39919.5118195 | -0.227 |
| 39935.8307524 | -0.114 |
| 39952.189688 | 0.227 |
| 39968.5176219 | 0.114 |
| 39984.8295549 | -0.043 |
| 40001.1444875 | 0.099 |
| 40017.4644204 | 0.043 |
| 40033.7903537 | 0.014 |
| 40050.1072864 | 0.241 |
| 40066.4182182 | 0.284 |
| 40082.7601529 | -0.071 |
| 40099.0730837 | -0.057 |
| 40115.3790147 | -0.043 |
| 40131.7109483 | 0.114 |
| 40148.0238791 | 0.071 |
| 40164.3708118 | 0.114 |
| 40180.6787429 | -0.185 |
| 40196.993675 | 0.043 |
| 40213.35061 | 0.014 |
| 40229.6685427 | 0.128 |
| 40245.9874756 | -0.142 |
| 40262.3134094 | 0.312 |
| 40278.6203415 | 0.028 |
| 40294.9722768 | 0.028 |
| 40311.29821 | 0.369 |
| 40327.6161433 | 0.213 |
| 40343.9370763 | 0.043 |
| 40360.2840096 | 0.114 |
| 40376.6069427 | 0.043 |
| 40392.9458766 | -0.142 |
| 40409.2728088 | 0.227 |
| 40425.5917411 | 0.043 |
| 40441.9366749 | 0.099 |
| 40458.2406063 | -0.156 |
| 40474.548539 | -0.043 |
| 40490.869472 | -0.213 |
| 40507.1894037 | 0.128 |
| 40523.5213356 | 0.185 |
| 40539.8242676 | 0.185 |
| 40556.1672018 | 0.156 |
| 40572.4931356 | 0.114 |
| 40588.8090688 | 0.043 |
| 40605.1140014 | 0.028 |
| 40621.4279334 | 0.17 |
| 40637.7518659 | -0.128 |
| 40654.0817999 | 0.27 |
| 40670.4207345 | -0.085 |
| 40686.7386661 | 0.185 |
| 40703.0515986 | -0.014 |
| 40719.3715315 | 0.057 |
| 40735.6884637 | -0.128 |
| 40752.0043963 | -0.099 |
| 40768.311329 | -0.043 |
| 40784.6022608 | 0.099 |
| 40800.9241944 | -0.057 |
| 40817.2431261 | 0.071 |
| 40833.5590587 | 0.213 |
| 40849.8919918 | 0.043 |
| 40866.216925 | 0.454 |
| 40882.5378585 | 0.156 |
| 40898.893794 | 0.128 |
| 40915.2037258 | 0.312 |
| 40931.5236587 | -0.057 |
| 40947.8395908 | 0.213 |
| 40964.1595236 | 0.284 |
| 40980.4864575 | 0.014 |
| 40996.7923885 | 0.255 |
| 41013.1263222 | -0.085 |
| 41029.4722571 | 0.043 |
| 41045.810191 | 0.497 |
| 41062.122124 | 0.284 |
| 41078.4720569 | 0.17 |
| 41094.7849889 | 0.241 |
| 41111.1059212 | 0.114 |
| 41127.4278542 | 0.114 |
| 41143.7517879 | 0.27 |
| 41160.0497201 | 0.128 |
| 41176.3656522 | -0.128 |
| 41192.7065857 | 0.298 |
| 41209.04052 | -0.028 |
| 41225.3464526 | 0.043 |
| 41241.6783851 | 0.128 |
| 41257.9883174 | 0.085 |
| 41274.3232506 | -0.057 |
| 41290.6501845 | -0.057 |
| 41306.964117 | 0.114 |
| 41323.2770478 | 0.27 |
| 41339.5959806 | 0.142 |
| 41355.907912 | 0.085 |
| 41372.2198449 | 0.142 |
| 41388.5297773 | 0.142 |
| 41404.8407096 | 0.298 |
| 41421.1696425 | 0.142 |
| 41437.4955763 | 0.27 |
| 41453.7995077 | -0.014 |
| 41470.1454426 | 0.199 |
| 41486.4573745 | 0.284 |
| 41502.7823077 | 0.043 |
| 41519.0852401 | 0.099 |
| 41535.3991727 | -0.014 |
| 41551.7181039 | 0.071 |
| 41568.0600386 | 0.085 |
| 41584.3849712 | 0.142 |
| 41600.6769025 | 0.412 |
| 41616.9938341 | -0.085 |
| 41633.321768 | 0.071 |
| 41649.6397013 | -0.128 |
| 41665.9526338 | 0.085 |
| 41682.2795671 | 0.298 |
| 41698.6175004 | 0.043 |
| 41714.9344332 | 0.071 |
| 41731.2723665 | 0.128 |
| 41747.5772991 | 0.326 |
| 41763.8662308 | 0.057 |
| 41780.1981649 | 0.085 |
| 41796.5050971 | 0.028 |
| 41812.8270301 | -0.114 |
| 41829.1489636 | 0.071 |
| 41845.4868981 | 0.043 |
| 41861.8438337 | -0.014 |
| 41878.1897669 | -0.043 |
| 41894.5127 | -0.043 |
| 41910.8186321 | -0.071 |
| 41927.1305639 | 0.397 |
| 41943.444497 | 0.043 |
| 41959.7464283 | 0 |
| 41976.0723605 | 0.114 |
| 41992.3882926 | 0.227 |
| 42008.6822234 | 0.085 |
| 42025.0091573 | 0.028 |
| 42041.3140887 | 0.369 |
| 42057.6380218 | 0.199 |
| 42073.961955 | -0.085 |
| 42090.2898883 | 0.071 |
| 42106.6098201 | -0.114 |
| 42122.9627554 | -0.099 |
| 42139.3016899 | 0.043 |
| 42155.6256214 | -0.213 |
| 42171.9545542 | 0.44 |
| 42188.2784879 | -0.014 |
| 42204.6124216 | 0.142 |
| 42220.9673565 | 0.085 |
| 42237.3202907 | 0.17 |
| 42253.6352233 | 0.099 |
| 42269.9701576 | 0.043 |
| 42286.3020901 | 0.014 |
| 42302.625022 | 0.156 |
| 42318.9379545 | -0.028 |
| 42335.2708887 | 0.44 |
| 42351.579821 | 0.255 |
| 42367.8967542 | 0.397 |
| 42384.232688 | 0.142 |
| 42400.5536193 | 0.085 |
| 42416.8735522 | 0.312 |
| 42433.1934856 | 0.142 |
| 42449.4974159 | 0.312 |
| 42465.8213485 | 0.468 |
| 42482.1642816 | 0.014 |
| 42498.4692131 | 0.128 |
| 42514.7871458 | 0.17 |
| 42531.1140791 | 0.199 |
| 42547.4270116 | 0.114 |
| 42563.746944 | 0.369 |
| 42580.0618754 | 0.284 |
| 42596.4058091 | 0.114 |
| 42612.7617446 | -0.043 |
| 42629.1036794 | 0.028 |
| 42645.4156107 | -0.085 |
| 42661.742544 | 0.213 |
| 42678.0564765 | -0.043 |
| 42694.3694096 | 0.17 |
| 42710.6863417 | -0.028 |
| 42727.0052751 | 0.057 |
| 42743.307207 | 0.27 |
| 42759.6291377 | 0.043 |
| 42775.9400695 | 0.057 |
| 42792.2490024 | 0 |
| 42808.5609354 | 0 |
| 42824.875868 | 0.128 |
| 42841.1937991 | 0.057 |
| 42857.5027319 | 0.028 |
| 42873.8216647 | 0.17 |
| 42890.1465968 | 0.142 |
| 42906.479531 | 0.185 |
| 42922.802464 | 0.298 |
| 42939.1473978 | 0.028 |
| 42955.4553294 | 0.028 |
| 42971.7702615 | 0.142 |
| 42988.0931951 | 0.156 |
| 43004.3981254 | 0.326 |
| 43020.7290584 | 0 |
| 43037.0389907 | 0.298 |
| 43053.3629238 | 0.511 |
| 43069.6948574 | 0.114 |
| 43086.0347914 | -0.071 |
| 43102.3517236 | 0.156 |
| 43118.6856567 | -0.128 |
| 43135.0005888 | -0.114 |
| 43151.3305228 | 0.185 |
| 43167.645456 | 0.043 |
| 43183.9623881 | 0.341 |
| 43200.3003209 | 0.099 |
| 43216.6032534 | -0.043 |
| 43232.9161853 | 0.241 |
| 43249.2321169 | 0.028 |
| 43265.5540488 | 0.128 |
| 43281.8889831 | 0.114 |
| 43298.2019161 | 0.028 |
| 43314.52985 | -0.028 |
| 43330.8467822 | -0.213 |
| 43347.1697147 | 0.17 |
| 43363.4896464 | -0.241 |
| 43379.7965791 | -0.114 |
| 43396.1195122 | 0.028 |
| 43412.438445 | -0.114 |
| 43428.7533782 | 0.284 |
| 43445.089312 | 0 |
| 43461.3802432 | -0.17 |
| 43477.7301784 | -0.028 |
| 43494.0561116 | 0.128 |
| 43510.3770446 | -0.312 |
| 43526.6729755 | 0.043 |
| 43542.9879081 | -0.043 |
| 43559.3048409 | 0.156 |
| 43575.6177739 | -0.057 |
| 43591.9917104 | 0.085 |
| 43608.3366453 | -0.099 |
| 43624.6555776 | 0.298 |
| 43640.96751 | -0.014 |
| 43657.3024438 | 0.412 |
| 43673.6313772 | 0.085 |
| 43689.9573087 | -0.17 |
| 43706.2782422 | -0.099 |
| 43722.5811741 | 0.128 |
| 43738.918108 | 0.057 |
| 43755.2350396 | 0.326 |
| 43771.546972 | 0.128 |
| 43787.867905 | 0.071 |
| 43804.1938382 | 0.071 |
| 43820.5117704 | 0.099 |
| 43836.8257019 | 0.17 |
| 43853.140635 | 0.369 |
| 43869.4715691 | 0.085 |
| 43885.7915014 | 0.213 |
| 43902.1124344 | 0.043 |
| 43918.4553691 | 0.227 |
| 43934.7763021 | 0.213 |
| 43951.1192357 | 0.128 |
| 43967.4501692 | 0.199 |
| 43983.7701016 | -0.014 |
| 44000.1050353 | 0.071 |
| 44016.4099679 | 0.326 |
| 44032.7288996 | 0.255 |
| 44049.0588331 | 0.156 |
| 44065.3947669 | 0.156 |
| 44081.7187006 | 0.185 |
| 44098.0526337 | 0.341 |
| 44114.3925666 | 0.128 |
| 44130.7345013 | 0.355 |
| 44147.0544342 | 0.142 |
| 44163.3643671 | 0.156 |
| 44179.6833005 | 0.341 |
| 44196.0022333 | 0.014 |
| 44212.3231657 | 0.156 |
| 44228.6360976 | 0.142 |
| 44244.9540304 | 0.312 |
| 44261.278963 | 0.298 |
| 44277.5968958 | 0.057 |
| 44293.9208289 | 0.199 |
| 44310.2507629 | 0.213 |
| 44326.5706953 | 0.17 |
| 44342.8836283 | 0.071 |
| 44359.2015616 | 0.17 |
| 44375.5244947 | 0.241 |
| 44391.8614291 | 0.057 |
| 44408.1983619 | 0.128 |
| 44424.5012943 | 0.227 |
| 44440.8092265 | 0.284 |
| 44457.1151592 | 0.071 |
| 44473.4170916 | 0.199 |
| 44489.7090229 | 0.099 |
| 44506.0299553 | -0.028 |
| 44522.3498887 | 0.199 |
| 44538.6708222 | 0.099 |
| 44554.998755 | 0.099 |
| 44571.3186879 | 0.383 |
| 44587.6606221 | 0.539 |
| 44603.9645546 | 0.27 |
| 44620.3044886 | 0.397 |
| 44636.6524231 | 0.114 |
| 44652.9583552 | -0.156 |
| 44669.2702882 | 0.213 |
| 44685.5902211 | 0.213 |
| 44701.893153 | 0.241 |
| 44718.2030859 | 0.241 |
| 44734.5470207 | 0.057 |
| 44750.8589526 | 0.085 |
| 44767.1768859 | 0.27 |
| 44783.5048192 | 0.071 |
| 44799.8177512 | 0.142 |
| 44816.1366846 | 0.028 |
| 44832.4536178 | 0.114 |
| 44848.7685504 | 0.043 |
| 44865.0794828 | 0.185 |
| 44881.3914147 | -0.071 |
| 44897.7033471 | 0.17 |
| 44914.0202798 | 0.497 |
| 44930.3652142 | 0.142 |
| 44946.6831464 | 0.185 |
| 44963.0000791 | 0.17 |
| 44979.3100108 | 0.099 |
| 44995.6409449 | 0.298 |
| 45011.9528774 | 0.227 |
| 45028.2638081 | 0.355 |
| 45044.5807408 | 0.128 |
| 45060.9206754 | 0.17 |
| 45077.236608 | 0.298 |
| 45093.568541 | 0.284 |
| 45109.914476 | 0.043 |
| 45126.2204086 | 0.199 |
| 45142.5473425 | 0.383 |
| 45158.8562753 | 0.255 |
| 45175.2102107 | 0.043 |
| 45191.5391435 | 0.199 |
| 45207.8710771 | 0.014 |
| 45224.2040107 | 0.185 |
| 45240.5379444 | 0.312 |
| 45256.8648777 | 0.142 |
| 45273.1968107 | 0.057 |
| 45289.5367453 | 0.085 |
| 45305.8486772 | 0.142 |
| 45322.1556099 | 0.057 |
| 45338.4915443 | 0.241 |
| 45354.819477 | 0.213 |
| 45371.1524107 | 0.227 |
| 45387.4563432 | 0.44 |
| 45403.7812758 | 0.44 |
| 45420.0842072 | -0.014 |
| 45436.4191409 | 0.326 |
| 45452.7640752 | 0.213 |
| 45469.0910074 | 0.255 |
| 45485.4209403 | 0.355 |
| 45501.7478736 | 0.227 |
| 45518.0558053 | 0.383 |
| 45534.3887389 | 0.085 |
| 45550.7096724 | 0.255 |
| 45567.0426066 | 0.085 |
| 45583.3555391 | 0.057 |
| 45599.683473 | 0.057 |
| 45616.0164055 | 0.156 |
| 45632.3263384 | 0.114 |
| 45648.651271 | 0.185 |
| 45664.9682043 | 0.241 |
| 45681.3051381 | 0.483 |
| 45697.6530732 | 0.355 |
| 45713.9720066 | 0.284 |
| 45730.2859391 | 0.426 |
| 45746.6108723 | 0.185 |
| 45762.9258049 | 0.099 |
| 45779.2457372 | 0.17 |
| 45795.5526688 | 0.312 |
| 45811.8625989 | 0.085 |
| 45828.1915317 | 0.156 |
| 45844.5054648 | 0.156 |
| 45860.8463978 | 0.284 |
| 45877.1503287 | 0.128 |
| 45893.470261 | -0.043 |
| 45909.7911934 | 0.114 |
| 45926.1221258 | 0.128 |
| 45942.4620598 | 0.085 |
| 45958.7729922 | -0.028 |
| 45975.1039252 | 0.043 |
| 45991.4268588 | 0.142 |
| 46007.7337915 | 0.17 |
| 46024.0607231 | -0.185 |
| 46040.3916566 | 0.326 |
| 46056.738591 | 0.27 |
| 46073.067525 | 0.114 |
| 46089.371457 | 0.085 |
| 46105.6873891 | 0.057 |
| 46122.0103216 | -0.043 |
| 46138.3122534 | 0.014 |
| 46154.6311868 | 0.639 |
| 46170.9421186 | 0.284 |
| 46187.2590502 | 0.099 |
| 46203.5819827 | 0.454 |
| 46219.8949152 | 0.17 |
| 46236.2148481 | 0.199 |
| 46252.5257805 | 0.213 |
| 46268.8357123 | -0.185 |
| 46285.1716461 | 0.284 |
| 46301.486577 | 0.043 |
| 46317.803508 | 0.142 |
| 46334.124441 | 0.128 |
| 46350.4553745 | 0.028 |
| 46366.7753068 | 0.241 |
| 46383.1342419 | 0.355 |
| 46399.4521736 | 0.369 |
| 46415.7701053 | 0.383 |
| 46432.1060391 | 0.483 |
| 46448.4379704 | 0.383 |
| 46464.7719041 | 0.213 |
| 46481.1428393 | 0.397 |
| 46497.4777714 | 0.525 |
| 46513.8067048 | 0.298 |
| 46530.1376367 | 0.227 |
| 46546.500572 | 0.326 |
| 46562.8105038 | 0.128 |
| 46579.1144363 | 0.298 |
| 46595.4203678 | 0.27 |
| 46611.7493012 | 0.511 |
| 46628.0982363 | -0.043 |
| 46644.42217 | 0.213 |
| 46660.7371021 | 0.383 |
| 46677.0670361 | 0.199 |
| 46693.3839682 | 0.241 |
| 46709.7179014 | 0.142 |
| 46726.0248341 | 0.355 |
| 46742.3287661 | 0.114 |
| 46758.6396968 | 0.511 |
| 46774.9686302 | 0.043 |
| 46791.2895631 | -0.057 |
| 46807.6034962 | 0.142 |
| 46823.9194294 | 0.227 |
| 46840.2433625 | 0.071 |
| 46856.573296 | 0.468 |
| 46872.8972286 | 0.213 |
| 46889.2041613 | 0.114 |
| 46905.4920929 | 0.156 |
| 46921.826026 | 0.27 |
| 46938.1379584 | 0.312 |
| 46954.4648917 | 0.085 |
| 46970.7718233 | 0.185 |
| 46987.1027563 | 0.199 |
| 47003.4186878 | -0.043 |
| 47019.7316198 | 0.44 |
| 47036.0495531 | 0.312 |
| 47052.3864869 | 0.028 |
| 47068.7034197 | 0.142 |
| 47085.0103513 | 0.114 |
| 47101.3242838 | -0.043 |
| 47117.6252156 | 0.312 |
| 47133.9481481 | 0.383 |
| 47150.2730818 | 0.397 |
| 47166.5880144 | 0.27 |
| 47182.9249477 | 0.355 |
| 47199.2308798 | 0.412 |
| 47215.5528117 | -0.028 |
| 47231.8617445 | 0.099 |
| 47248.1876783 | 0.624 |
| 47264.5026093 | 0.17 |
| 47280.8225421 | 0.241 |
| 47297.1514761 | 0.114 |
| 47313.5044114 | 0.199 |
| 47329.8553455 | 0.028 |
| 47346.1752784 | 0.17 |
| 47362.4982109 | 0.227 |
| 47378.8051425 | 0.057 |
| 47395.1180733 | 0.185 |
| 47411.4350038 | 0.17 |
| 47427.7539355 | -0.156 |
| 47444.0668664 | 0.241 |
| 47460.3767987 | 0.043 |
| 47476.6887305 | 0.128 |
| 47493.0106624 | 0.071 |
| 47509.3215942 | 0.185 |
| 47525.6465274 | 0.185 |
| 47541.9544602 | 0.17 |
| 47558.2713923 | 0.185 |
| 47574.5773239 | 0.369 |
| 47590.884256 | 0.142 |
| 47607.2481914 | 0.099 |
| 47623.564123 | 0.355 |
| 47639.8720552 | 0.043 |
| 47656.1969883 | 0.241 |
| 47672.5029199 | -0.156 |
| 47688.8318516 | 0.213 |
| 47705.1377837 | 0.27 |
| 47721.4847181 | 0.156 |
| 47737.7926498 | 0.17 |
| 47754.1085819 | 0.085 |
| 47770.4275153 | -0.014 |
| 47786.7544491 | 0.185 |
| 47803.0813818 | 0.383 |
| 47819.3973139 | 0.227 |
| 47835.7232477 | 0.369 |
| 47852.0461813 | 0.071 |
| 47868.3631135 | 0.185 |
| 47884.6830464 | 0.298 |
| 47901.0099786 | 0.099 |
| 47917.3329111 | 0.185 |
| 47933.6448441 | 0.014 |
| 47949.9867788 | 0.497 |
| 47966.3107113 | 0.114 |
| 47982.6216431 | 0.185 |
| 47998.9285742 | -0.057 |
| 48015.2435073 | 0.284 |
| 48031.5614407 | 0.014 |
| 48047.888374 | -0.043 |
| 48064.2073062 | -0.114 |
| 48080.5292392 | -0.114 |
| 48096.8661725 | 0.341 |
| 48113.1751048 | -0.071 |
| 48129.4960361 | -0.085 |
| 48145.8099681 | 0.057 |
| 48162.1429022 | 0.057 |
| 48178.4598355 | 0.142 |
| 48194.7677677 | 0.213 |
| 48211.0716991 | 0.27 |
| 48227.3966318 | 0.043 |
| 48243.7145651 | 0.17 |
| 48260.0474987 | 0.114 |
| 48276.3674322 | 0.213 |
| 48292.6843654 | 0.057 |
| 48308.9992986 | 0.156 |
| 48325.2952307 | 0.128 |
| 48341.6181637 | 0.17 |
| 48357.9570977 | -0.028 |
| 48374.2660283 | 0 |
| 48390.5839611 | 0.185 |
| 48406.8798926 | 0.241 |
| 48423.2038251 | -0.17 |
| 48439.5107578 | 0.128 |
| 48455.8286906 | 0 |
| 48472.1526237 | 0.114 |
| 48488.4685564 | 0.043 |
| 48504.7774881 | 0.255 |
| 48521.0884199 | 0.156 |
| 48537.4033531 | 0.426 |
| 48553.7202864 | 0.142 |
| 48570.0332194 | 0.199 |
| 48586.3471519 | 0.156 |
| 48602.6590849 | 0.412 |
| 48618.973018 | 0.043 |
| 48635.2879506 | 0.057 |
| 48651.6028827 | 0.355 |
| 48667.940816 | -0.028 |
| 48684.2437474 | 0.326 |
| 48700.5536803 | 0.185 |
| 48716.8916136 | -0.071 |
| 48733.209547 | 0.227 |
| 48749.5364808 | 0.426 |
| 48765.8474132 | 0 |
| 48782.1663455 | 0.156 |
| 48798.4792768 | 0.156 |
| 48814.7952089 | 0.255 |
| 48831.1181398 | -0.043 |
| 48847.4280715 | 0.114 |
| 48863.7460049 | 0.227 |
| 48880.0799374 | 0.454 |
| 48896.3948695 | 0.128 |
| 48912.7118022 | 0.043 |
| 48929.0267348 | 0.185 |
| 48945.4026703 | 0.312 |
| 48961.7146033 | 0.199 |
| 48978.0185353 | 0.057 |
| 48994.3474687 | 0.156 |
| 49010.6624007 | 0.185 |
| 49026.980333 | 0.213 |
| 49043.310267 | 0.199 |
| 49059.6351996 | 0.454 |
| 49075.9641336 | 0.114 |
| 49092.2810652 | 0.085 |
| 49108.5959978 | 0.128 |
| 49124.9239311 | 0.028 |
| 49141.2718662 | 0.043 |
| 49157.575797 | 0.199 |
| 49173.9337321 | 0.142 |
| 49190.2626649 | 0.071 |
| 49206.612599 | -0.085 |
| 49222.9275305 | 0 |
| 49239.2574645 | 0.227 |
| 49255.6153995 | 0.554 |
| 49271.9413328 | 0.255 |
| 49288.2532652 | -0.227 |
| 49304.5741976 | 0.128 |
| 49320.8701291 | 0.057 |
| 49337.2050634 | 0.199 |
| 49353.5209966 | 0.014 |
| 49369.8599306 | 0.355 |
| 49386.2018636 | 0.312 |
| 49402.5067962 | 0.298 |
| 49418.83273 | 0.114 |
| 49435.1606622 | 0.099 |
| 49451.4715952 | 0.298 |
| 49467.8095291 | 0.014 |
| 49484.1434628 | -0.114 |
| 49500.4783971 | 0.156 |
| 49516.8003284 | 0.369 |
| 49533.1362611 | 0.014 |
| 49549.4531944 | 0.227 |
| 49565.7631273 | 0.014 |
| 49582.0890599 | -0.014 |